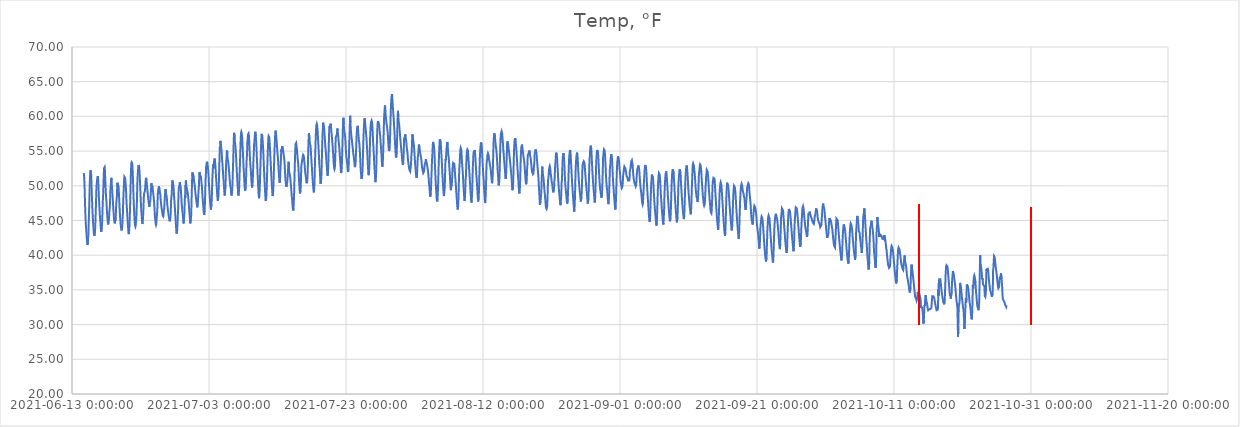
| Category | Temp, °F |
|---|---|
| 44361.716134259266 | 51.841 |
| 44361.75849537037 | 51.532 |
| 44361.80085648148 | 50.837 |
| 44361.8432175926 | 49.601 |
| 44361.8855787037 | 47.98 |
| 44361.927939814814 | 46.59 |
| 44361.97030092593 | 45.431 |
| 44362.012662037036 | 44.582 |
| 44362.05502314815 | 43.964 |
| 44362.097384259265 | 43.346 |
| 44362.13974537037 | 42.651 |
| 44362.18210648148 | 42.265 |
| 44362.2244675926 | 41.802 |
| 44362.26682870371 | 41.493 |
| 44362.30918981481 | 41.57 |
| 44362.35155092593 | 42.497 |
| 44362.39391203704 | 42.96 |
| 44362.436273148145 | 44.505 |
| 44362.47863425926 | 45.895 |
| 44362.520995370374 | 47.362 |
| 44362.56335648148 | 49.215 |
| 44362.605717592596 | 50.682 |
| 44362.64807870371 | 51.686 |
| 44362.69043981481 | 52.227 |
| 44362.73280092593 | 52.304 |
| 44362.77516203704 | 51.995 |
| 44362.817523148144 | 51.146 |
| 44362.85988425926 | 49.833 |
| 44362.90224537037 | 48.52 |
| 44362.944606481484 | 47.516 |
| 44362.986967592595 | 46.435 |
| 44363.029328703706 | 45.586 |
| 44363.07168981482 | 44.814 |
| 44363.11405092593 | 44.196 |
| 44363.15641203704 | 43.578 |
| 44363.19877314815 | 43.115 |
| 44363.24113425926 | 42.806 |
| 44363.28349537037 | 42.729 |
| 44363.32585648148 | 43.038 |
| 44363.36821759259 | 43.578 |
| 44363.410578703704 | 44.582 |
| 44363.452939814815 | 45.895 |
| 44363.49530092593 | 47.13 |
| 44363.53766203704 | 48.829 |
| 44363.58002314815 | 49.987 |
| 44363.622384259266 | 50.374 |
| 44363.66474537037 | 50.837 |
| 44363.70710648148 | 51.146 |
| 44363.7494675926 | 51.377 |
| 44363.7918287037 | 51.223 |
| 44363.83418981482 | 50.682 |
| 44363.876550925925 | 49.524 |
| 44363.918912037036 | 48.52 |
| 44363.961273148154 | 47.748 |
| 44364.00363425926 | 46.821 |
| 44364.04599537037 | 46.204 |
| 44364.08835648149 | 45.354 |
| 44364.1307175926 | 44.968 |
| 44364.1730787037 | 44.273 |
| 44364.21543981482 | 43.81 |
| 44364.25780092593 | 43.346 |
| 44364.300162037034 | 43.346 |
| 44364.34252314815 | 43.964 |
| 44364.38488425926 | 44.428 |
| 44364.42724537037 | 45.509 |
| 44364.469606481485 | 46.899 |
| 44364.511967592596 | 48.057 |
| 44364.5543287037 | 48.829 |
| 44364.59668981482 | 50.296 |
| 44364.63905092593 | 51.686 |
| 44364.68141203703 | 52.536 |
| 44364.72377314815 | 52.536 |
| 44364.76613425926 | 52.69 |
| 44364.80849537037 | 52.15 |
| 44364.850856481484 | 51.069 |
| 44364.893217592595 | 50.065 |
| 44364.935578703706 | 49.061 |
| 44364.97793981482 | 48.289 |
| 44365.02030092593 | 47.825 |
| 44365.06266203704 | 46.976 |
| 44365.10502314815 | 46.204 |
| 44365.14738425926 | 45.74 |
| 44365.18974537037 | 45.123 |
| 44365.23210648148 | 44.736 |
| 44365.27446759259 | 44.428 |
| 44365.316828703704 | 44.582 |
| 44365.359189814815 | 44.814 |
| 44365.401550925926 | 45.354 |
| 44365.44391203704 | 46.126 |
| 44365.486273148155 | 46.59 |
| 44365.52863425926 | 47.13 |
| 44365.57099537037 | 48.289 |
| 44365.61335648149 | 49.756 |
| 44365.65571759259 | 49.987 |
| 44365.6980787037 | 50.76 |
| 44365.74043981482 | 51.146 |
| 44365.782800925925 | 50.682 |
| 44365.825162037036 | 49.987 |
| 44365.867523148154 | 49.292 |
| 44365.90988425926 | 48.597 |
| 44365.95224537037 | 48.057 |
| 44365.99460648149 | 47.285 |
| 44366.0369675926 | 46.59 |
| 44366.0793287037 | 46.049 |
| 44366.12168981482 | 45.431 |
| 44366.16405092593 | 45.045 |
| 44366.206412037034 | 44.814 |
| 44366.24877314815 | 44.582 |
| 44366.29113425926 | 44.505 |
| 44366.333495370374 | 44.659 |
| 44366.375856481485 | 45.354 |
| 44366.41821759259 | 46.358 |
| 44366.46057870371 | 47.439 |
| 44366.50293981482 | 47.98 |
| 44366.54530092592 | 48.289 |
| 44366.58766203704 | 49.524 |
| 44366.63002314815 | 50.451 |
| 44366.67238425926 | 49.91 |
| 44366.71474537037 | 50.142 |
| 44366.757106481484 | 50.065 |
| 44366.799467592595 | 49.756 |
| 44366.841828703706 | 49.061 |
| 44366.88418981482 | 48.211 |
| 44366.92655092593 | 47.285 |
| 44366.96891203704 | 46.435 |
| 44367.01127314815 | 45.663 |
| 44367.05363425926 | 45.123 |
| 44367.09599537037 | 44.505 |
| 44367.13835648148 | 44.119 |
| 44367.18071759259 | 43.887 |
| 44367.223078703704 | 43.578 |
| 44367.265439814815 | 43.501 |
| 44367.307800925926 | 43.887 |
| 44367.350162037044 | 44.428 |
| 44367.39252314815 | 45.354 |
| 44367.43488425926 | 46.049 |
| 44367.47724537038 | 47.748 |
| 44367.51960648148 | 48.829 |
| 44367.56196759259 | 49.679 |
| 44367.60432870371 | 50.837 |
| 44367.646689814814 | 51.3 |
| 44367.689050925925 | 51.223 |
| 44367.73141203704 | 51.146 |
| 44367.77377314815 | 50.991 |
| 44367.81613425926 | 50.528 |
| 44367.858495370376 | 49.91 |
| 44367.90085648148 | 49.061 |
| 44367.94321759259 | 47.98 |
| 44367.98557870371 | 47.13 |
| 44368.02793981482 | 46.59 |
| 44368.07030092592 | 45.74 |
| 44368.11266203704 | 45.123 |
| 44368.15502314815 | 44.428 |
| 44368.197384259256 | 43.887 |
| 44368.239745370374 | 43.346 |
| 44368.282106481485 | 43.038 |
| 44368.32446759259 | 43.269 |
| 44368.36682870371 | 43.887 |
| 44368.40918981482 | 44.891 |
| 44368.45155092592 | 46.049 |
| 44368.49391203704 | 47.594 |
| 44368.53627314815 | 49.292 |
| 44368.57863425926 | 51.069 |
| 44368.62099537037 | 52.304 |
| 44368.663356481484 | 53.231 |
| 44368.705717592595 | 53.385 |
| 44368.748078703706 | 53.308 |
| 44368.79043981482 | 53.231 |
| 44368.83280092593 | 52.69 |
| 44368.87516203704 | 51.686 |
| 44368.91752314815 | 50.528 |
| 44368.95988425926 | 49.061 |
| 44369.00224537037 | 47.902 |
| 44369.04460648148 | 46.821 |
| 44369.08696759259 | 45.972 |
| 44369.129328703704 | 45.277 |
| 44369.171689814815 | 44.659 |
| 44369.21405092593 | 44.273 |
| 44369.25641203704 | 44.119 |
| 44369.29877314815 | 44.273 |
| 44369.341134259266 | 44.814 |
| 44369.38349537037 | 45.2 |
| 44369.42585648148 | 46.513 |
| 44369.4682175926 | 47.516 |
| 44369.5105787037 | 49.138 |
| 44369.552939814814 | 50.837 |
| 44369.59530092593 | 51.609 |
| 44369.637662037036 | 52.15 |
| 44369.68002314815 | 52.767 |
| 44369.722384259265 | 52.999 |
| 44369.76474537037 | 52.922 |
| 44369.80710648148 | 52.69 |
| 44369.8494675926 | 52.072 |
| 44369.89182870371 | 51.3 |
| 44369.93418981481 | 50.374 |
| 44369.97655092593 | 49.447 |
| 44370.01891203704 | 48.366 |
| 44370.061273148145 | 47.362 |
| 44370.10363425926 | 46.59 |
| 44370.145995370374 | 45.972 |
| 44370.18835648148 | 45.354 |
| 44370.230717592596 | 44.891 |
| 44370.27307870371 | 44.505 |
| 44370.31543981481 | 44.659 |
| 44370.35780092593 | 45.277 |
| 44370.40016203704 | 45.972 |
| 44370.442523148144 | 47.13 |
| 44370.48488425926 | 48.366 |
| 44370.52724537037 | 48.906 |
| 44370.569606481484 | 48.906 |
| 44370.611967592595 | 48.984 |
| 44370.654328703706 | 49.292 |
| 44370.69668981482 | 49.91 |
| 44370.73905092593 | 50.528 |
| 44370.78141203704 | 50.991 |
| 44370.82377314815 | 51.146 |
| 44370.86613425926 | 50.914 |
| 44370.90849537037 | 50.374 |
| 44370.95085648148 | 49.91 |
| 44370.99321759259 | 49.524 |
| 44371.035578703704 | 49.061 |
| 44371.077939814815 | 48.675 |
| 44371.12030092593 | 48.289 |
| 44371.16266203704 | 47.825 |
| 44371.20502314815 | 47.516 |
| 44371.247384259266 | 47.207 |
| 44371.28974537037 | 46.976 |
| 44371.33210648148 | 47.516 |
| 44371.3744675926 | 47.516 |
| 44371.4168287037 | 47.671 |
| 44371.45918981482 | 48.211 |
| 44371.501550925925 | 48.906 |
| 44371.543912037036 | 49.524 |
| 44371.586273148154 | 50.374 |
| 44371.62863425926 | 50.142 |
| 44371.67099537037 | 49.756 |
| 44371.71335648149 | 49.987 |
| 44371.7557175926 | 49.833 |
| 44371.7980787037 | 49.37 |
| 44371.84043981482 | 49.061 |
| 44371.88280092593 | 48.675 |
| 44371.925162037034 | 48.289 |
| 44371.96752314815 | 47.825 |
| 44372.00988425926 | 47.362 |
| 44372.05224537037 | 46.513 |
| 44372.094606481485 | 45.74 |
| 44372.136967592596 | 45.277 |
| 44372.1793287037 | 44.891 |
| 44372.22168981482 | 44.505 |
| 44372.26405092593 | 44.35 |
| 44372.30641203703 | 44.505 |
| 44372.34877314815 | 45.2 |
| 44372.39113425926 | 45.74 |
| 44372.43349537037 | 46.204 |
| 44372.475856481484 | 46.976 |
| 44372.518217592595 | 48.675 |
| 44372.560578703706 | 49.292 |
| 44372.60293981482 | 48.829 |
| 44372.64530092593 | 49.601 |
| 44372.68766203704 | 49.91 |
| 44372.73002314815 | 49.756 |
| 44372.77238425926 | 49.601 |
| 44372.81474537037 | 49.215 |
| 44372.85710648148 | 49.138 |
| 44372.89946759259 | 48.675 |
| 44372.941828703704 | 48.057 |
| 44372.984189814815 | 47.594 |
| 44373.026550925926 | 47.207 |
| 44373.06891203704 | 46.821 |
| 44373.111273148155 | 46.59 |
| 44373.15363425926 | 46.281 |
| 44373.19599537037 | 46.049 |
| 44373.23835648149 | 45.74 |
| 44373.28071759259 | 45.74 |
| 44373.3230787037 | 45.586 |
| 44373.36543981482 | 45.74 |
| 44373.407800925925 | 46.513 |
| 44373.450162037036 | 46.667 |
| 44373.492523148154 | 47.285 |
| 44373.53488425926 | 48.134 |
| 44373.57724537037 | 48.057 |
| 44373.61960648149 | 49.215 |
| 44373.6619675926 | 49.524 |
| 44373.7043287037 | 48.984 |
| 44373.74668981482 | 48.906 |
| 44373.78905092593 | 48.675 |
| 44373.831412037034 | 48.366 |
| 44373.87377314815 | 47.825 |
| 44373.91613425926 | 47.207 |
| 44373.958495370374 | 46.899 |
| 44374.000856481485 | 46.435 |
| 44374.04321759259 | 46.204 |
| 44374.08557870371 | 45.895 |
| 44374.12793981482 | 45.586 |
| 44374.17030092592 | 45.354 |
| 44374.21266203704 | 45.123 |
| 44374.25502314815 | 44.891 |
| 44374.29738425926 | 44.968 |
| 44374.33974537037 | 45.277 |
| 44374.382106481484 | 45.431 |
| 44374.424467592595 | 46.435 |
| 44374.466828703706 | 47.902 |
| 44374.50918981482 | 47.902 |
| 44374.55155092593 | 48.752 |
| 44374.59391203704 | 49.679 |
| 44374.63627314815 | 50.76 |
| 44374.67863425926 | 50.76 |
| 44374.72099537037 | 50.682 |
| 44374.76335648148 | 50.296 |
| 44374.80571759259 | 49.987 |
| 44374.848078703704 | 49.447 |
| 44374.890439814815 | 48.675 |
| 44374.932800925926 | 48.134 |
| 44374.975162037044 | 47.439 |
| 44375.01752314815 | 46.899 |
| 44375.05988425926 | 46.126 |
| 44375.10224537038 | 45.431 |
| 44375.14460648148 | 44.736 |
| 44375.18696759259 | 44.119 |
| 44375.22932870371 | 43.501 |
| 44375.271689814814 | 43.115 |
| 44375.314050925925 | 43.192 |
| 44375.35641203704 | 43.655 |
| 44375.39877314815 | 44.35 |
| 44375.44113425926 | 45.586 |
| 44375.483495370376 | 46.204 |
| 44375.52585648148 | 47.902 |
| 44375.56821759259 | 49.292 |
| 44375.61057870371 | 49.833 |
| 44375.65293981482 | 49.91 |
| 44375.69530092592 | 49.987 |
| 44375.73766203704 | 50.528 |
| 44375.78002314815 | 50.219 |
| 44375.822384259256 | 50.142 |
| 44375.864745370374 | 49.833 |
| 44375.907106481485 | 49.292 |
| 44375.94946759259 | 48.52 |
| 44375.99182870371 | 47.748 |
| 44376.03418981482 | 47.13 |
| 44376.07655092592 | 46.744 |
| 44376.11891203704 | 46.281 |
| 44376.16127314815 | 45.972 |
| 44376.20363425926 | 45.509 |
| 44376.24599537037 | 45.045 |
| 44376.288356481484 | 44.582 |
| 44376.330717592595 | 45.123 |
| 44376.373078703706 | 45.509 |
| 44376.41543981482 | 46.126 |
| 44376.45780092593 | 47.825 |
| 44376.50016203704 | 48.597 |
| 44376.54252314815 | 48.289 |
| 44376.58488425926 | 50.065 |
| 44376.62724537037 | 50.76 |
| 44376.66960648148 | 50.219 |
| 44376.71196759259 | 49.833 |
| 44376.754328703704 | 49.756 |
| 44376.796689814815 | 49.524 |
| 44376.83905092593 | 49.292 |
| 44376.88141203704 | 49.061 |
| 44376.92377314815 | 48.829 |
| 44376.966134259266 | 48.366 |
| 44377.00849537037 | 47.902 |
| 44377.05085648148 | 47.362 |
| 44377.0932175926 | 46.821 |
| 44377.1355787037 | 46.281 |
| 44377.177939814814 | 45.663 |
| 44377.22030092593 | 45.2 |
| 44377.262662037036 | 44.582 |
| 44377.30502314815 | 44.582 |
| 44377.347384259265 | 45.277 |
| 44377.38974537037 | 45.663 |
| 44377.43210648148 | 46.976 |
| 44377.4744675926 | 48.752 |
| 44377.51682870371 | 50.219 |
| 44377.55918981481 | 51.686 |
| 44377.60155092593 | 51.918 |
| 44377.64391203704 | 51.455 |
| 44377.686273148145 | 51.3 |
| 44377.72863425926 | 51.455 |
| 44377.770995370374 | 51.3 |
| 44377.81335648148 | 50.682 |
| 44377.855717592596 | 50.374 |
| 44377.89807870371 | 50.219 |
| 44377.94043981481 | 49.833 |
| 44377.98280092593 | 49.292 |
| 44378.02516203704 | 48.906 |
| 44378.067523148144 | 48.52 |
| 44378.10988425926 | 48.134 |
| 44378.15224537037 | 47.825 |
| 44378.194606481484 | 47.516 |
| 44378.236967592595 | 47.207 |
| 44378.279328703706 | 46.899 |
| 44378.32168981482 | 46.976 |
| 44378.36405092593 | 47.439 |
| 44378.40641203704 | 48.134 |
| 44378.44877314815 | 48.829 |
| 44378.49113425926 | 49.524 |
| 44378.53349537037 | 50.065 |
| 44378.57585648148 | 51.377 |
| 44378.61821759259 | 51.995 |
| 44378.660578703704 | 51.609 |
| 44378.702939814815 | 51.532 |
| 44378.74530092593 | 51.686 |
| 44378.78766203704 | 51.609 |
| 44378.83002314815 | 51.3 |
| 44378.872384259266 | 50.76 |
| 44378.91474537037 | 50.374 |
| 44378.95710648148 | 49.987 |
| 44378.9994675926 | 49.37 |
| 44379.0418287037 | 48.675 |
| 44379.08418981482 | 47.98 |
| 44379.126550925925 | 47.594 |
| 44379.168912037036 | 46.976 |
| 44379.211273148154 | 46.435 |
| 44379.25363425926 | 46.049 |
| 44379.29599537037 | 45.818 |
| 44379.33835648149 | 46.435 |
| 44379.3807175926 | 46.744 |
| 44379.4230787037 | 47.98 |
| 44379.46543981482 | 49.756 |
| 44379.50780092593 | 51.069 |
| 44379.550162037034 | 51.764 |
| 44379.59252314815 | 52.767 |
| 44379.63488425926 | 52.536 |
| 44379.67724537037 | 53.308 |
| 44379.719606481485 | 53.462 |
| 44379.761967592596 | 53.153 |
| 44379.8043287037 | 53.076 |
| 44379.84668981482 | 52.69 |
| 44379.88905092593 | 52.072 |
| 44379.93141203703 | 51.532 |
| 44379.97377314815 | 50.682 |
| 44380.01613425926 | 49.91 |
| 44380.05849537037 | 49.292 |
| 44380.100856481484 | 48.597 |
| 44380.143217592595 | 47.98 |
| 44380.185578703706 | 47.439 |
| 44380.22793981482 | 46.976 |
| 44380.27030092593 | 46.59 |
| 44380.31266203704 | 46.59 |
| 44380.35502314815 | 47.285 |
| 44380.39738425926 | 47.902 |
| 44380.43974537037 | 49.292 |
| 44380.48210648148 | 50.914 |
| 44380.52446759259 | 51.609 |
| 44380.566828703704 | 52.613 |
| 44380.609189814815 | 53.076 |
| 44380.651550925926 | 52.536 |
| 44380.69391203704 | 52.922 |
| 44380.736273148155 | 53.54 |
| 44380.77863425926 | 53.771 |
| 44380.82099537037 | 53.926 |
| 44380.86335648149 | 53.694 |
| 44380.90571759259 | 53.231 |
| 44380.9480787037 | 52.69 |
| 44380.99043981482 | 51.918 |
| 44381.032800925925 | 51.223 |
| 44381.075162037036 | 50.605 |
| 44381.117523148154 | 49.987 |
| 44381.15988425926 | 49.37 |
| 44381.20224537037 | 48.675 |
| 44381.24460648149 | 48.134 |
| 44381.2869675926 | 47.825 |
| 44381.3293287037 | 47.98 |
| 44381.37168981482 | 48.52 |
| 44381.41405092593 | 49.601 |
| 44381.456412037034 | 51.069 |
| 44381.49877314815 | 52.767 |
| 44381.54113425926 | 54.389 |
| 44381.583495370374 | 55.547 |
| 44381.625856481485 | 55.702 |
| 44381.66821759259 | 56.474 |
| 44381.71057870371 | 56.165 |
| 44381.75293981482 | 55.856 |
| 44381.79530092592 | 55.393 |
| 44381.83766203704 | 54.93 |
| 44381.88002314815 | 54.235 |
| 44381.92238425926 | 53.617 |
| 44381.96474537037 | 53.153 |
| 44382.007106481484 | 52.536 |
| 44382.049467592595 | 51.841 |
| 44382.091828703706 | 51.069 |
| 44382.13418981482 | 50.76 |
| 44382.17655092593 | 50.065 |
| 44382.21891203704 | 49.37 |
| 44382.26127314815 | 48.829 |
| 44382.30363425926 | 48.597 |
| 44382.34599537037 | 49.215 |
| 44382.38835648148 | 49.524 |
| 44382.43071759259 | 50.76 |
| 44382.473078703704 | 52.458 |
| 44382.515439814815 | 53.617 |
| 44382.557800925926 | 53.848 |
| 44382.600162037044 | 54.852 |
| 44382.64252314815 | 55.084 |
| 44382.68488425926 | 54.08 |
| 44382.72724537038 | 53.926 |
| 44382.76960648148 | 53.694 |
| 44382.81196759259 | 53.385 |
| 44382.85432870371 | 52.922 |
| 44382.896689814814 | 52.536 |
| 44382.939050925925 | 51.995 |
| 44382.98141203704 | 51.455 |
| 44383.02377314815 | 50.837 |
| 44383.06613425926 | 50.374 |
| 44383.108495370376 | 50.065 |
| 44383.15085648148 | 49.756 |
| 44383.19321759259 | 49.524 |
| 44383.23557870371 | 48.906 |
| 44383.27793981482 | 48.597 |
| 44383.32030092592 | 48.752 |
| 44383.36266203704 | 48.984 |
| 44383.40502314815 | 49.833 |
| 44383.447384259256 | 50.837 |
| 44383.489745370374 | 52.304 |
| 44383.532106481485 | 53.617 |
| 44383.57446759259 | 55.238 |
| 44383.61682870371 | 56.628 |
| 44383.65918981482 | 57.632 |
| 44383.70155092592 | 57.71 |
| 44383.74391203704 | 57.092 |
| 44383.78627314815 | 56.165 |
| 44383.82863425926 | 56.011 |
| 44383.87099537037 | 55.547 |
| 44383.913356481484 | 54.93 |
| 44383.955717592595 | 54.08 |
| 44383.998078703706 | 53.308 |
| 44384.04043981482 | 52.536 |
| 44384.08280092593 | 51.609 |
| 44384.12516203704 | 50.914 |
| 44384.16752314815 | 50.219 |
| 44384.20988425926 | 49.679 |
| 44384.25224537037 | 48.984 |
| 44384.29460648148 | 48.597 |
| 44384.33696759259 | 48.906 |
| 44384.379328703704 | 49.215 |
| 44384.421689814815 | 50.296 |
| 44384.46405092593 | 51.686 |
| 44384.50641203704 | 52.767 |
| 44384.54877314815 | 54.157 |
| 44384.591134259266 | 55.625 |
| 44384.63349537037 | 56.86 |
| 44384.67585648148 | 57.632 |
| 44384.7182175926 | 57.787 |
| 44384.7605787037 | 57.632 |
| 44384.802939814814 | 57.323 |
| 44384.84530092593 | 56.937 |
| 44384.887662037036 | 56.011 |
| 44384.93002314815 | 55.238 |
| 44384.972384259265 | 54.312 |
| 44385.01474537037 | 53.308 |
| 44385.05710648148 | 52.458 |
| 44385.0994675926 | 51.841 |
| 44385.14182870371 | 50.914 |
| 44385.18418981481 | 50.142 |
| 44385.22655092593 | 49.601 |
| 44385.26891203704 | 49.292 |
| 44385.311273148145 | 49.37 |
| 44385.35363425926 | 49.679 |
| 44385.395995370374 | 50.451 |
| 44385.43835648148 | 51.918 |
| 44385.480717592596 | 53.54 |
| 44385.52307870371 | 54.08 |
| 44385.56543981481 | 55.084 |
| 44385.60780092593 | 56.474 |
| 44385.65016203704 | 56.706 |
| 44385.692523148144 | 57.401 |
| 44385.73488425926 | 57.401 |
| 44385.77724537037 | 57.555 |
| 44385.819606481484 | 57.323 |
| 44385.861967592595 | 56.551 |
| 44385.904328703706 | 55.625 |
| 44385.94668981482 | 54.621 |
| 44385.98905092593 | 53.848 |
| 44386.03141203704 | 53.153 |
| 44386.07377314815 | 52.613 |
| 44386.11613425926 | 52.072 |
| 44386.15849537037 | 51.223 |
| 44386.20085648148 | 50.605 |
| 44386.24321759259 | 50.142 |
| 44386.285578703704 | 49.756 |
| 44386.327939814815 | 49.987 |
| 44386.37030092593 | 50.451 |
| 44386.41266203704 | 51.455 |
| 44386.45502314815 | 52.767 |
| 44386.497384259266 | 53.926 |
| 44386.53974537037 | 54.698 |
| 44386.58210648148 | 55.933 |
| 44386.6244675926 | 56.32 |
| 44386.6668287037 | 56.86 |
| 44386.70918981482 | 57.401 |
| 44386.751550925925 | 57.787 |
| 44386.793912037036 | 57.71 |
| 44386.836273148154 | 57.169 |
| 44386.87863425926 | 56.474 |
| 44386.92099537037 | 55.547 |
| 44386.96335648149 | 54.698 |
| 44387.0057175926 | 53.694 |
| 44387.0480787037 | 52.69 |
| 44387.09043981482 | 51.764 |
| 44387.13280092593 | 50.914 |
| 44387.175162037034 | 50.065 |
| 44387.21752314815 | 49.292 |
| 44387.25988425926 | 48.597 |
| 44387.30224537037 | 48.211 |
| 44387.344606481485 | 48.597 |
| 44387.386967592596 | 49.061 |
| 44387.4293287037 | 50.296 |
| 44387.47168981482 | 51.841 |
| 44387.51405092593 | 53.076 |
| 44387.55641203703 | 54.466 |
| 44387.59877314815 | 55.702 |
| 44387.64113425926 | 56.706 |
| 44387.68349537037 | 57.478 |
| 44387.725856481484 | 57.555 |
| 44387.768217592595 | 57.246 |
| 44387.810578703706 | 56.86 |
| 44387.85293981482 | 56.165 |
| 44387.89530092593 | 55.47 |
| 44387.93766203704 | 54.621 |
| 44387.98002314815 | 53.54 |
| 44388.02238425926 | 52.536 |
| 44388.06474537037 | 51.609 |
| 44388.10710648148 | 50.682 |
| 44388.14946759259 | 49.91 |
| 44388.191828703704 | 49.061 |
| 44388.234189814815 | 48.366 |
| 44388.276550925926 | 47.825 |
| 44388.31891203704 | 47.825 |
| 44388.361273148155 | 48.289 |
| 44388.40363425926 | 49.061 |
| 44388.44599537037 | 50.451 |
| 44388.48835648149 | 51.918 |
| 44388.53071759259 | 53.308 |
| 44388.5730787037 | 54.698 |
| 44388.61543981482 | 55.779 |
| 44388.657800925925 | 56.783 |
| 44388.700162037036 | 57.169 |
| 44388.742523148154 | 57.169 |
| 44388.78488425926 | 57.015 |
| 44388.82724537037 | 56.551 |
| 44388.86960648149 | 55.856 |
| 44388.9119675926 | 55.161 |
| 44388.9543287037 | 54.312 |
| 44388.99668981482 | 53.54 |
| 44389.03905092593 | 52.69 |
| 44389.081412037034 | 51.841 |
| 44389.12377314815 | 50.991 |
| 44389.16613425926 | 50.296 |
| 44389.208495370374 | 49.601 |
| 44389.250856481485 | 48.984 |
| 44389.29321759259 | 48.52 |
| 44389.33557870371 | 48.752 |
| 44389.37793981482 | 49.37 |
| 44389.42030092592 | 50.451 |
| 44389.46266203704 | 51.841 |
| 44389.50502314815 | 53.153 |
| 44389.54738425926 | 54.621 |
| 44389.58974537037 | 55.779 |
| 44389.632106481484 | 56.706 |
| 44389.674467592595 | 57.71 |
| 44389.716828703706 | 57.941 |
| 44389.75918981482 | 57.787 |
| 44389.80155092593 | 57.323 |
| 44389.84391203704 | 56.86 |
| 44389.88627314815 | 56.242 |
| 44389.92863425926 | 55.625 |
| 44389.97099537037 | 55.084 |
| 44390.01335648148 | 54.543 |
| 44390.05571759259 | 54.157 |
| 44390.098078703704 | 53.385 |
| 44390.140439814815 | 52.767 |
| 44390.182800925926 | 52.072 |
| 44390.225162037044 | 51.377 |
| 44390.26752314815 | 50.76 |
| 44390.30988425926 | 50.451 |
| 44390.35224537038 | 50.76 |
| 44390.39460648148 | 51.377 |
| 44390.43696759259 | 52.69 |
| 44390.47932870371 | 53.308 |
| 44390.521689814814 | 54.389 |
| 44390.564050925925 | 55.238 |
| 44390.60641203704 | 54.852 |
| 44390.64877314815 | 55.47 |
| 44390.69113425926 | 55.702 |
| 44390.733495370376 | 55.702 |
| 44390.77585648148 | 55.316 |
| 44390.81821759259 | 55.084 |
| 44390.86057870371 | 54.775 |
| 44390.90293981482 | 54.466 |
| 44390.94530092592 | 54.157 |
| 44390.98766203704 | 53.848 |
| 44391.03002314815 | 53.308 |
| 44391.072384259256 | 52.536 |
| 44391.114745370374 | 51.686 |
| 44391.157106481485 | 51.069 |
| 44391.19946759259 | 50.528 |
| 44391.24182870371 | 50.219 |
| 44391.28418981482 | 49.833 |
| 44391.32655092592 | 49.91 |
| 44391.36891203704 | 50.219 |
| 44391.41127314815 | 50.451 |
| 44391.45363425926 | 50.914 |
| 44391.49599537037 | 51.532 |
| 44391.538356481484 | 52.227 |
| 44391.580717592595 | 52.999 |
| 44391.623078703706 | 53.462 |
| 44391.66543981482 | 52.69 |
| 44391.70780092593 | 51.918 |
| 44391.75016203704 | 51.918 |
| 44391.79252314815 | 51.686 |
| 44391.83488425926 | 51.377 |
| 44391.87724537037 | 51.069 |
| 44391.91960648148 | 50.451 |
| 44391.96196759259 | 50.065 |
| 44392.004328703704 | 49.524 |
| 44392.046689814815 | 48.906 |
| 44392.08905092593 | 48.443 |
| 44392.13141203704 | 48.057 |
| 44392.17377314815 | 47.439 |
| 44392.216134259266 | 46.899 |
| 44392.25849537037 | 46.59 |
| 44392.30085648148 | 46.435 |
| 44392.3432175926 | 46.821 |
| 44392.3855787037 | 47.748 |
| 44392.427939814814 | 48.984 |
| 44392.47030092593 | 50.837 |
| 44392.512662037036 | 52.536 |
| 44392.55502314815 | 54.003 |
| 44392.597384259265 | 55.161 |
| 44392.63974537037 | 56.011 |
| 44392.68210648148 | 56.088 |
| 44392.7244675926 | 56.165 |
| 44392.76682870371 | 56.088 |
| 44392.80918981481 | 55.47 |
| 44392.85155092593 | 55.084 |
| 44392.89391203704 | 54.543 |
| 44392.936273148145 | 53.926 |
| 44392.97863425926 | 53.617 |
| 44393.020995370374 | 53.153 |
| 44393.06335648148 | 52.458 |
| 44393.105717592596 | 51.609 |
| 44393.14807870371 | 50.76 |
| 44393.19043981481 | 50.065 |
| 44393.23280092593 | 49.37 |
| 44393.27516203704 | 48.906 |
| 44393.317523148144 | 48.829 |
| 44393.35988425926 | 49.292 |
| 44393.40224537037 | 50.065 |
| 44393.444606481484 | 51.686 |
| 44393.486967592595 | 52.922 |
| 44393.529328703706 | 53.231 |
| 44393.57168981482 | 53.54 |
| 44393.61405092593 | 53.771 |
| 44393.65641203704 | 53.926 |
| 44393.69877314815 | 54.312 |
| 44393.74113425926 | 54.466 |
| 44393.78349537037 | 54.543 |
| 44393.82585648148 | 54.312 |
| 44393.86821759259 | 54.003 |
| 44393.910578703704 | 53.54 |
| 44393.952939814815 | 53.153 |
| 44393.99530092593 | 52.536 |
| 44394.03766203704 | 51.995 |
| 44394.08002314815 | 51.686 |
| 44394.122384259266 | 51.455 |
| 44394.16474537037 | 51.069 |
| 44394.20710648148 | 50.76 |
| 44394.2494675926 | 50.374 |
| 44394.2918287037 | 50.296 |
| 44394.33418981482 | 50.682 |
| 44394.376550925925 | 51.223 |
| 44394.418912037036 | 52.304 |
| 44394.461273148154 | 53.926 |
| 44394.50363425926 | 55.47 |
| 44394.54599537037 | 56.783 |
| 44394.58835648149 | 57.555 |
| 44394.6307175926 | 57.555 |
| 44394.6730787037 | 56.706 |
| 44394.71543981482 | 56.165 |
| 44394.75780092593 | 56.165 |
| 44394.800162037034 | 55.856 |
| 44394.84252314815 | 55.393 |
| 44394.88488425926 | 54.775 |
| 44394.92724537037 | 54.08 |
| 44394.969606481485 | 53.385 |
| 44395.011967592596 | 52.845 |
| 44395.0543287037 | 52.072 |
| 44395.09668981482 | 51.377 |
| 44395.13905092593 | 50.76 |
| 44395.18141203703 | 50.219 |
| 44395.22377314815 | 49.679 |
| 44395.26613425926 | 49.215 |
| 44395.30849537037 | 49.061 |
| 44395.350856481484 | 49.524 |
| 44395.393217592595 | 50.219 |
| 44395.435578703706 | 51.764 |
| 44395.47793981482 | 53.54 |
| 44395.52030092593 | 55.007 |
| 44395.56266203704 | 56.397 |
| 44395.60502314815 | 57.555 |
| 44395.64738425926 | 58.404 |
| 44395.68974537037 | 58.791 |
| 44395.73210648148 | 58.945 |
| 44395.77446759259 | 58.791 |
| 44395.816828703704 | 58.404 |
| 44395.859189814815 | 57.864 |
| 44395.901550925926 | 57.092 |
| 44395.94391203704 | 56.397 |
| 44395.986273148155 | 55.547 |
| 44396.02863425926 | 54.775 |
| 44396.07099537037 | 53.848 |
| 44396.11335648149 | 52.999 |
| 44396.15571759259 | 52.536 |
| 44396.1980787037 | 51.841 |
| 44396.24043981482 | 50.991 |
| 44396.282800925925 | 50.296 |
| 44396.325162037036 | 50.296 |
| 44396.367523148154 | 50.837 |
| 44396.40988425926 | 51.532 |
| 44396.45224537037 | 52.922 |
| 44396.49460648149 | 54.621 |
| 44396.5369675926 | 56.165 |
| 44396.5793287037 | 57.401 |
| 44396.62168981482 | 58.173 |
| 44396.66405092593 | 59.099 |
| 44396.706412037034 | 58.945 |
| 44396.74877314815 | 58.945 |
| 44396.79113425926 | 58.482 |
| 44396.833495370374 | 57.941 |
| 44396.875856481485 | 57.246 |
| 44396.91821759259 | 56.706 |
| 44396.96057870371 | 56.011 |
| 44397.00293981482 | 55.47 |
| 44397.04530092592 | 55.007 |
| 44397.08766203704 | 54.466 |
| 44397.13002314815 | 53.771 |
| 44397.17238425926 | 53.153 |
| 44397.21474537037 | 52.536 |
| 44397.257106481484 | 51.995 |
| 44397.299467592595 | 51.455 |
| 44397.341828703706 | 51.609 |
| 44397.38418981482 | 52.227 |
| 44397.42655092593 | 53.385 |
| 44397.46891203704 | 55.084 |
| 44397.51127314815 | 56.706 |
| 44397.55363425926 | 58.25 |
| 44397.59599537037 | 58.559 |
| 44397.63835648148 | 58.327 |
| 44397.68071759259 | 58.404 |
| 44397.723078703704 | 58.791 |
| 44397.765439814815 | 58.945 |
| 44397.807800925926 | 58.636 |
| 44397.850162037044 | 57.941 |
| 44397.89252314815 | 57.555 |
| 44397.93488425926 | 57.092 |
| 44397.97724537038 | 56.551 |
| 44398.01960648148 | 56.088 |
| 44398.06196759259 | 55.547 |
| 44398.10432870371 | 54.852 |
| 44398.146689814814 | 54.235 |
| 44398.189050925925 | 53.462 |
| 44398.23141203704 | 52.999 |
| 44398.27377314815 | 52.536 |
| 44398.31613425926 | 52.381 |
| 44398.358495370376 | 52.536 |
| 44398.40085648148 | 53.076 |
| 44398.44321759259 | 54.466 |
| 44398.48557870371 | 56.32 |
| 44398.52793981482 | 57.092 |
| 44398.57030092592 | 57.092 |
| 44398.61266203704 | 57.015 |
| 44398.65502314815 | 57.323 |
| 44398.697384259256 | 57.71 |
| 44398.739745370374 | 58.25 |
| 44398.782106481485 | 57.941 |
| 44398.82446759259 | 57.478 |
| 44398.86682870371 | 57.169 |
| 44398.90918981482 | 56.628 |
| 44398.95155092592 | 56.165 |
| 44398.99391203704 | 55.779 |
| 44399.03627314815 | 55.238 |
| 44399.07863425926 | 54.698 |
| 44399.12099537037 | 54.003 |
| 44399.163356481484 | 53.462 |
| 44399.205717592595 | 52.845 |
| 44399.248078703706 | 52.227 |
| 44399.29043981482 | 51.841 |
| 44399.33280092593 | 51.995 |
| 44399.37516203704 | 52.613 |
| 44399.41752314815 | 53.617 |
| 44399.45988425926 | 55.161 |
| 44399.50224537037 | 56.628 |
| 44399.54460648148 | 58.25 |
| 44399.58696759259 | 59.408 |
| 44399.629328703704 | 59.794 |
| 44399.671689814815 | 58.868 |
| 44399.71405092593 | 58.173 |
| 44399.75641203704 | 57.787 |
| 44399.79877314815 | 57.71 |
| 44399.841134259266 | 57.401 |
| 44399.88349537037 | 57.015 |
| 44399.92585648148 | 56.242 |
| 44399.9682175926 | 55.393 |
| 44400.0105787037 | 54.698 |
| 44400.052939814814 | 54.157 |
| 44400.09530092593 | 53.926 |
| 44400.137662037036 | 53.54 |
| 44400.18002314815 | 53.153 |
| 44400.222384259265 | 52.69 |
| 44400.26474537037 | 52.15 |
| 44400.30710648148 | 51.995 |
| 44400.3494675926 | 52.381 |
| 44400.39182870371 | 53.076 |
| 44400.43418981481 | 54.466 |
| 44400.47655092593 | 56.011 |
| 44400.51891203704 | 57.478 |
| 44400.561273148145 | 58.791 |
| 44400.60363425926 | 60.103 |
| 44400.645995370374 | 59.177 |
| 44400.68835648148 | 58.327 |
| 44400.730717592596 | 57.71 |
| 44400.77307870371 | 57.323 |
| 44400.81543981481 | 56.937 |
| 44400.85780092593 | 56.628 |
| 44400.90016203704 | 56.165 |
| 44400.942523148144 | 55.779 |
| 44400.98488425926 | 55.47 |
| 44401.02724537037 | 54.93 |
| 44401.069606481484 | 54.621 |
| 44401.111967592595 | 54.312 |
| 44401.154328703706 | 54.003 |
| 44401.19668981482 | 53.617 |
| 44401.23905092593 | 53.231 |
| 44401.28141203704 | 52.69 |
| 44401.32377314815 | 52.767 |
| 44401.36613425926 | 52.922 |
| 44401.40849537037 | 53.462 |
| 44401.45085648148 | 54.543 |
| 44401.49321759259 | 55.702 |
| 44401.535578703704 | 56.86 |
| 44401.577939814815 | 57.787 |
| 44401.62030092593 | 58.25 |
| 44401.66266203704 | 58.482 |
| 44401.70502314815 | 58.636 |
| 44401.747384259266 | 58.327 |
| 44401.78974537037 | 57.71 |
| 44401.83210648148 | 57.169 |
| 44401.8744675926 | 56.628 |
| 44401.9168287037 | 56.32 |
| 44401.95918981482 | 55.933 |
| 44402.001550925925 | 55.316 |
| 44402.043912037036 | 54.543 |
| 44402.086273148154 | 53.617 |
| 44402.12863425926 | 52.69 |
| 44402.17099537037 | 51.995 |
| 44402.21335648149 | 51.532 |
| 44402.2557175926 | 50.991 |
| 44402.2980787037 | 50.914 |
| 44402.34043981482 | 51.3 |
| 44402.38280092593 | 51.764 |
| 44402.425162037034 | 52.69 |
| 44402.46752314815 | 54.08 |
| 44402.50988425926 | 55.625 |
| 44402.55224537037 | 57.015 |
| 44402.594606481485 | 58.018 |
| 44402.636967592596 | 58.868 |
| 44402.6793287037 | 59.563 |
| 44402.72168981482 | 59.717 |
| 44402.76405092593 | 59.486 |
| 44402.80641203703 | 58.945 |
| 44402.84877314815 | 58.404 |
| 44402.89113425926 | 58.096 |
| 44402.93349537037 | 57.478 |
| 44402.975856481484 | 57.015 |
| 44403.018217592595 | 56.397 |
| 44403.060578703706 | 55.625 |
| 44403.10293981482 | 54.852 |
| 44403.14530092593 | 53.926 |
| 44403.18766203704 | 53.076 |
| 44403.23002314815 | 52.381 |
| 44403.27238425926 | 51.686 |
| 44403.31474537037 | 51.532 |
| 44403.35710648148 | 51.918 |
| 44403.39946759259 | 52.536 |
| 44403.441828703704 | 53.848 |
| 44403.484189814815 | 55.547 |
| 44403.526550925926 | 57.169 |
| 44403.56891203704 | 58.018 |
| 44403.611273148155 | 58.791 |
| 44403.65363425926 | 59.177 |
| 44403.69599537037 | 59.254 |
| 44403.73835648149 | 59.408 |
| 44403.78071759259 | 59.254 |
| 44403.8230787037 | 59.022 |
| 44403.86543981482 | 58.327 |
| 44403.907800925925 | 57.478 |
| 44403.950162037036 | 56.474 |
| 44403.992523148154 | 55.779 |
| 44404.03488425926 | 54.93 |
| 44404.07724537037 | 54.235 |
| 44404.11960648149 | 53.308 |
| 44404.1619675926 | 52.536 |
| 44404.2043287037 | 51.918 |
| 44404.24668981482 | 51.146 |
| 44404.28905092593 | 50.528 |
| 44404.331412037034 | 50.682 |
| 44404.37377314815 | 51.223 |
| 44404.41613425926 | 52.304 |
| 44404.458495370374 | 54.003 |
| 44404.500856481485 | 55.779 |
| 44404.54321759259 | 57.323 |
| 44404.58557870371 | 58.404 |
| 44404.62793981482 | 59.099 |
| 44404.67030092592 | 59.331 |
| 44404.71266203704 | 59.177 |
| 44404.75502314815 | 59.099 |
| 44404.79738425926 | 59.022 |
| 44404.83974537037 | 58.713 |
| 44404.882106481484 | 58.173 |
| 44404.924467592595 | 57.71 |
| 44404.966828703706 | 57.401 |
| 44405.00918981482 | 56.937 |
| 44405.05155092593 | 56.242 |
| 44405.09391203704 | 55.702 |
| 44405.13627314815 | 55.161 |
| 44405.17863425926 | 54.466 |
| 44405.22099537037 | 53.694 |
| 44405.26335648148 | 53.076 |
| 44405.30571759259 | 52.767 |
| 44405.348078703704 | 53.076 |
| 44405.390439814815 | 53.771 |
| 44405.432800925926 | 55.084 |
| 44405.475162037044 | 56.628 |
| 44405.51752314815 | 58.25 |
| 44405.55988425926 | 59.717 |
| 44405.60224537038 | 60.489 |
| 44405.64460648148 | 61.03 |
| 44405.68696759259 | 61.571 |
| 44405.72932870371 | 61.416 |
| 44405.771689814814 | 60.412 |
| 44405.814050925925 | 59.949 |
| 44405.85641203704 | 59.563 |
| 44405.89877314815 | 59.099 |
| 44405.94113425926 | 58.791 |
| 44405.983495370376 | 58.636 |
| 44406.02585648148 | 58.173 |
| 44406.06821759259 | 57.864 |
| 44406.11057870371 | 57.323 |
| 44406.15293981482 | 56.551 |
| 44406.19530092592 | 55.933 |
| 44406.23766203704 | 55.316 |
| 44406.28002314815 | 55.007 |
| 44406.322384259256 | 55.084 |
| 44406.364745370374 | 55.393 |
| 44406.407106481485 | 56.165 |
| 44406.44946759259 | 57.478 |
| 44406.49182870371 | 59.254 |
| 44406.53418981482 | 60.644 |
| 44406.57655092592 | 61.725 |
| 44406.61891203704 | 62.42 |
| 44406.66127314815 | 62.883 |
| 44406.70363425926 | 63.192 |
| 44406.74599537037 | 62.961 |
| 44406.788356481484 | 62.188 |
| 44406.830717592595 | 61.493 |
| 44406.873078703706 | 60.953 |
| 44406.91543981482 | 60.335 |
| 44406.95780092593 | 59.717 |
| 44407.00016203704 | 59.022 |
| 44407.04252314815 | 58.25 |
| 44407.08488425926 | 57.632 |
| 44407.12724537037 | 56.783 |
| 44407.16960648148 | 55.933 |
| 44407.21196759259 | 55.238 |
| 44407.254328703704 | 54.543 |
| 44407.296689814815 | 54.08 |
| 44407.33905092593 | 54.003 |
| 44407.38141203704 | 54.312 |
| 44407.42377314815 | 55.393 |
| 44407.466134259266 | 57.015 |
| 44407.50849537037 | 58.636 |
| 44407.55085648148 | 60.258 |
| 44407.5932175926 | 60.798 |
| 44407.6355787037 | 59.872 |
| 44407.677939814814 | 59.408 |
| 44407.72030092593 | 59.022 |
| 44407.762662037036 | 58.868 |
| 44407.80502314815 | 58.25 |
| 44407.847384259265 | 57.787 |
| 44407.88974537037 | 57.323 |
| 44407.93210648148 | 56.706 |
| 44407.9744675926 | 56.32 |
| 44408.01682870371 | 55.779 |
| 44408.05918981481 | 55.316 |
| 44408.10155092593 | 54.93 |
| 44408.14391203704 | 54.466 |
| 44408.186273148145 | 53.926 |
| 44408.22863425926 | 53.54 |
| 44408.270995370374 | 53.153 |
| 44408.31335648148 | 52.999 |
| 44408.355717592596 | 53.308 |
| 44408.39807870371 | 54.08 |
| 44408.44043981481 | 55.316 |
| 44408.48280092593 | 56.783 |
| 44408.52516203704 | 56.706 |
| 44408.567523148144 | 57.015 |
| 44408.60988425926 | 57.169 |
| 44408.65224537037 | 57.401 |
| 44408.694606481484 | 57.169 |
| 44408.736967592595 | 56.783 |
| 44408.779328703706 | 56.551 |
| 44408.82168981482 | 56.088 |
| 44408.86405092593 | 55.625 |
| 44408.90641203704 | 55.238 |
| 44408.94877314815 | 54.93 |
| 44408.99113425926 | 54.543 |
| 44409.03349537037 | 53.926 |
| 44409.07585648148 | 53.462 |
| 44409.11821759259 | 53.231 |
| 44409.160578703704 | 52.845 |
| 44409.202939814815 | 52.536 |
| 44409.24530092593 | 52.381 |
| 44409.28766203704 | 52.227 |
| 44409.33002314815 | 52.227 |
| 44409.372384259266 | 52.072 |
| 44409.41474537037 | 52.458 |
| 44409.45710648148 | 52.69 |
| 44409.4994675926 | 53.385 |
| 44409.5418287037 | 54.312 |
| 44409.58418981482 | 54.775 |
| 44409.626550925925 | 55.856 |
| 44409.668912037036 | 57.092 |
| 44409.711273148154 | 57.401 |
| 44409.75363425926 | 57.092 |
| 44409.79599537037 | 56.628 |
| 44409.83835648149 | 56.397 |
| 44409.8807175926 | 56.011 |
| 44409.9230787037 | 55.779 |
| 44409.96543981482 | 55.084 |
| 44410.00780092593 | 54.466 |
| 44410.050162037034 | 53.771 |
| 44410.09252314815 | 53.153 |
| 44410.13488425926 | 52.767 |
| 44410.17724537037 | 52.227 |
| 44410.219606481485 | 51.686 |
| 44410.261967592596 | 51.3 |
| 44410.3043287037 | 51.146 |
| 44410.34668981482 | 51.377 |
| 44410.38905092593 | 51.995 |
| 44410.43141203703 | 53.153 |
| 44410.47377314815 | 54.003 |
| 44410.51613425926 | 54.08 |
| 44410.55849537037 | 54.621 |
| 44410.600856481484 | 55.316 |
| 44410.643217592595 | 55.933 |
| 44410.685578703706 | 55.856 |
| 44410.72793981482 | 55.547 |
| 44410.77030092593 | 55.161 |
| 44410.81266203704 | 54.775 |
| 44410.85502314815 | 54.621 |
| 44410.89738425926 | 54.312 |
| 44410.93974537037 | 54.235 |
| 44410.98210648148 | 53.926 |
| 44411.02446759259 | 53.54 |
| 44411.066828703704 | 52.999 |
| 44411.109189814815 | 52.613 |
| 44411.151550925926 | 52.381 |
| 44411.19391203704 | 52.304 |
| 44411.236273148155 | 52.072 |
| 44411.27863425926 | 51.841 |
| 44411.32099537037 | 51.918 |
| 44411.36335648149 | 51.995 |
| 44411.40571759259 | 52.227 |
| 44411.4480787037 | 52.767 |
| 44411.49043981482 | 52.845 |
| 44411.532800925925 | 53.231 |
| 44411.575162037036 | 53.231 |
| 44411.617523148154 | 53.462 |
| 44411.65988425926 | 53.848 |
| 44411.70224537037 | 53.617 |
| 44411.74460648149 | 53.54 |
| 44411.7869675926 | 53.231 |
| 44411.8293287037 | 53.076 |
| 44411.87168981482 | 52.767 |
| 44411.91405092593 | 52.69 |
| 44411.956412037034 | 52.227 |
| 44411.99877314815 | 51.841 |
| 44412.04113425926 | 51.377 |
| 44412.083495370374 | 50.837 |
| 44412.125856481485 | 50.296 |
| 44412.16821759259 | 49.91 |
| 44412.21057870371 | 49.37 |
| 44412.25293981482 | 48.829 |
| 44412.29530092592 | 48.443 |
| 44412.33766203704 | 48.366 |
| 44412.38002314815 | 48.984 |
| 44412.42238425926 | 49.987 |
| 44412.46474537037 | 51.223 |
| 44412.507106481484 | 52.227 |
| 44412.549467592595 | 53.54 |
| 44412.591828703706 | 54.157 |
| 44412.63418981482 | 55.161 |
| 44412.67655092593 | 56.011 |
| 44412.71891203704 | 56.32 |
| 44412.76127314815 | 56.165 |
| 44412.80363425926 | 56.011 |
| 44412.84599537037 | 55.702 |
| 44412.88835648148 | 55.084 |
| 44412.93071759259 | 54.312 |
| 44412.973078703704 | 53.231 |
| 44413.015439814815 | 52.227 |
| 44413.057800925926 | 51.3 |
| 44413.100162037044 | 50.374 |
| 44413.14252314815 | 49.679 |
| 44413.18488425926 | 49.061 |
| 44413.22724537038 | 48.366 |
| 44413.26960648148 | 47.902 |
| 44413.31196759259 | 47.748 |
| 44413.35432870371 | 48.134 |
| 44413.396689814814 | 48.752 |
| 44413.439050925925 | 49.91 |
| 44413.48141203704 | 51.3 |
| 44413.52377314815 | 52.845 |
| 44413.56613425926 | 54.003 |
| 44413.608495370376 | 55.161 |
| 44413.65085648148 | 56.165 |
| 44413.69321759259 | 56.706 |
| 44413.73557870371 | 56.706 |
| 44413.77793981482 | 56.706 |
| 44413.82030092592 | 56.32 |
| 44413.86266203704 | 55.625 |
| 44413.90502314815 | 54.852 |
| 44413.947384259256 | 54.235 |
| 44413.989745370374 | 53.385 |
| 44414.032106481485 | 52.536 |
| 44414.07446759259 | 51.609 |
| 44414.11682870371 | 50.991 |
| 44414.15918981482 | 50.219 |
| 44414.20155092592 | 49.524 |
| 44414.24391203704 | 48.984 |
| 44414.28627314815 | 48.52 |
| 44414.32863425926 | 48.829 |
| 44414.37099537037 | 49.292 |
| 44414.413356481484 | 49.756 |
| 44414.455717592595 | 51.146 |
| 44414.498078703706 | 53.076 |
| 44414.54043981482 | 53.848 |
| 44414.58280092593 | 53.694 |
| 44414.62516203704 | 54.389 |
| 44414.66752314815 | 55.161 |
| 44414.70988425926 | 55.702 |
| 44414.75224537037 | 56.165 |
| 44414.79460648148 | 56.32 |
| 44414.83696759259 | 56.011 |
| 44414.879328703704 | 55.238 |
| 44414.921689814815 | 54.543 |
| 44414.96405092593 | 54.312 |
| 44415.00641203704 | 53.926 |
| 44415.04877314815 | 53.308 |
| 44415.091134259266 | 52.613 |
| 44415.13349537037 | 52.072 |
| 44415.17585648148 | 51.377 |
| 44415.2182175926 | 50.605 |
| 44415.2605787037 | 49.833 |
| 44415.302939814814 | 49.37 |
| 44415.34530092593 | 49.679 |
| 44415.387662037036 | 49.91 |
| 44415.43002314815 | 50.065 |
| 44415.472384259265 | 50.605 |
| 44415.51474537037 | 51.609 |
| 44415.55710648148 | 52.536 |
| 44415.5994675926 | 52.922 |
| 44415.64182870371 | 53.308 |
| 44415.68418981481 | 53.308 |
| 44415.72655092593 | 53.308 |
| 44415.76891203704 | 53.308 |
| 44415.811273148145 | 53.153 |
| 44415.85363425926 | 52.69 |
| 44415.895995370374 | 51.995 |
| 44415.93835648148 | 51.377 |
| 44415.980717592596 | 50.837 |
| 44416.02307870371 | 50.219 |
| 44416.06543981481 | 49.601 |
| 44416.10780092593 | 49.061 |
| 44416.15016203704 | 48.366 |
| 44416.192523148144 | 47.825 |
| 44416.23488425926 | 47.207 |
| 44416.27724537037 | 46.744 |
| 44416.319606481484 | 46.59 |
| 44416.361967592595 | 46.976 |
| 44416.404328703706 | 47.902 |
| 44416.44668981482 | 49.292 |
| 44416.48905092593 | 50.914 |
| 44416.53141203704 | 52.227 |
| 44416.57377314815 | 52.922 |
| 44416.61613425926 | 53.771 |
| 44416.65849537037 | 54.621 |
| 44416.70085648148 | 55.238 |
| 44416.74321759259 | 55.47 |
| 44416.785578703704 | 55.47 |
| 44416.827939814815 | 55.238 |
| 44416.87030092593 | 54.543 |
| 44416.91266203704 | 53.848 |
| 44416.95502314815 | 53.153 |
| 44416.997384259266 | 52.613 |
| 44417.03974537037 | 51.995 |
| 44417.08210648148 | 51.3 |
| 44417.1244675926 | 50.528 |
| 44417.1668287037 | 49.756 |
| 44417.20918981482 | 49.061 |
| 44417.251550925925 | 48.443 |
| 44417.293912037036 | 47.825 |
| 44417.336273148154 | 47.98 |
| 44417.37863425926 | 48.597 |
| 44417.42099537037 | 49.679 |
| 44417.46335648149 | 50.914 |
| 44417.5057175926 | 51.377 |
| 44417.5480787037 | 52.613 |
| 44417.59043981482 | 54.003 |
| 44417.63280092593 | 54.775 |
| 44417.675162037034 | 55.084 |
| 44417.71752314815 | 55.238 |
| 44417.75988425926 | 55.238 |
| 44417.80224537037 | 55.084 |
| 44417.844606481485 | 54.466 |
| 44417.886967592596 | 53.848 |
| 44417.9293287037 | 53.153 |
| 44417.97168981482 | 52.458 |
| 44418.01405092593 | 51.841 |
| 44418.05641203703 | 51.146 |
| 44418.09877314815 | 50.528 |
| 44418.14113425926 | 49.833 |
| 44418.18349537037 | 49.061 |
| 44418.225856481484 | 48.597 |
| 44418.268217592595 | 47.98 |
| 44418.310578703706 | 47.594 |
| 44418.35293981482 | 47.902 |
| 44418.39530092593 | 48.675 |
| 44418.43766203704 | 49.91 |
| 44418.48002314815 | 51.609 |
| 44418.52238425926 | 52.845 |
| 44418.56474537037 | 53.617 |
| 44418.60710648148 | 54.698 |
| 44418.64946759259 | 54.621 |
| 44418.691828703704 | 54.93 |
| 44418.734189814815 | 55.007 |
| 44418.776550925926 | 55.161 |
| 44418.81891203704 | 55.161 |
| 44418.861273148155 | 54.466 |
| 44418.90363425926 | 53.771 |
| 44418.94599537037 | 52.999 |
| 44418.98835648149 | 52.304 |
| 44419.03071759259 | 51.609 |
| 44419.0730787037 | 51.069 |
| 44419.11543981482 | 50.374 |
| 44419.157800925925 | 49.679 |
| 44419.200162037036 | 49.061 |
| 44419.242523148154 | 48.366 |
| 44419.28488425926 | 47.748 |
| 44419.32724537037 | 47.748 |
| 44419.36960648149 | 48.289 |
| 44419.4119675926 | 49.215 |
| 44419.4543287037 | 50.837 |
| 44419.49668981482 | 52.458 |
| 44419.53905092593 | 54.003 |
| 44419.581412037034 | 54.852 |
| 44419.62377314815 | 55.47 |
| 44419.66613425926 | 55.933 |
| 44419.708495370374 | 56.242 |
| 44419.750856481485 | 56.32 |
| 44419.79321759259 | 56.011 |
| 44419.83557870371 | 55.393 |
| 44419.87793981482 | 54.621 |
| 44419.92030092592 | 53.694 |
| 44419.96266203704 | 52.999 |
| 44420.00502314815 | 52.15 |
| 44420.04738425926 | 51.455 |
| 44420.08974537037 | 50.914 |
| 44420.132106481484 | 49.987 |
| 44420.174467592595 | 49.37 |
| 44420.216828703706 | 48.752 |
| 44420.25918981482 | 48.134 |
| 44420.30155092593 | 47.516 |
| 44420.34391203704 | 47.748 |
| 44420.38627314815 | 48.443 |
| 44420.42863425926 | 49.601 |
| 44420.47099537037 | 51.377 |
| 44420.51335648148 | 53.076 |
| 44420.55571759259 | 53.617 |
| 44420.598078703704 | 53.771 |
| 44420.640439814815 | 54.389 |
| 44420.682800925926 | 54.543 |
| 44420.725162037044 | 54.698 |
| 44420.76752314815 | 54.698 |
| 44420.80988425926 | 54.466 |
| 44420.85224537038 | 54.157 |
| 44420.89460648148 | 53.694 |
| 44420.93696759259 | 53.54 |
| 44420.97932870371 | 53.231 |
| 44421.021689814814 | 52.922 |
| 44421.064050925925 | 52.767 |
| 44421.10641203704 | 52.458 |
| 44421.14877314815 | 52.15 |
| 44421.19113425926 | 51.686 |
| 44421.233495370376 | 51.223 |
| 44421.27585648148 | 50.682 |
| 44421.31821759259 | 50.374 |
| 44421.36057870371 | 50.528 |
| 44421.40293981482 | 51.223 |
| 44421.44530092592 | 52.536 |
| 44421.48766203704 | 54.235 |
| 44421.53002314815 | 55.779 |
| 44421.572384259256 | 56.783 |
| 44421.614745370374 | 57.401 |
| 44421.657106481485 | 57.555 |
| 44421.69946759259 | 57.478 |
| 44421.74182870371 | 57.092 |
| 44421.78418981482 | 56.551 |
| 44421.82655092592 | 56.088 |
| 44421.86891203704 | 55.702 |
| 44421.91127314815 | 55.47 |
| 44421.95363425926 | 55.084 |
| 44421.99599537037 | 54.621 |
| 44422.038356481484 | 53.926 |
| 44422.080717592595 | 53.153 |
| 44422.123078703706 | 52.536 |
| 44422.16543981482 | 51.841 |
| 44422.20780092593 | 51.3 |
| 44422.25016203704 | 50.682 |
| 44422.29252314815 | 50.065 |
| 44422.33488425926 | 50.142 |
| 44422.37724537037 | 50.682 |
| 44422.41960648148 | 51.686 |
| 44422.46196759259 | 53.231 |
| 44422.504328703704 | 54.852 |
| 44422.546689814815 | 56.474 |
| 44422.58905092593 | 57.246 |
| 44422.63141203704 | 57.555 |
| 44422.67377314815 | 57.71 |
| 44422.716134259266 | 57.864 |
| 44422.75849537037 | 57.864 |
| 44422.80085648148 | 57.555 |
| 44422.8432175926 | 56.937 |
| 44422.8855787037 | 56.397 |
| 44422.927939814814 | 55.856 |
| 44422.97030092593 | 55.161 |
| 44423.012662037036 | 54.698 |
| 44423.05502314815 | 54.08 |
| 44423.097384259265 | 53.54 |
| 44423.13974537037 | 52.999 |
| 44423.18210648148 | 52.536 |
| 44423.2244675926 | 51.995 |
| 44423.26682870371 | 51.3 |
| 44423.30918981481 | 50.991 |
| 44423.35155092593 | 51.3 |
| 44423.39391203704 | 52.072 |
| 44423.436273148145 | 53.231 |
| 44423.47863425926 | 54.543 |
| 44423.520995370374 | 55.933 |
| 44423.56335648148 | 56.397 |
| 44423.605717592596 | 56.32 |
| 44423.64807870371 | 56.32 |
| 44423.69043981481 | 55.856 |
| 44423.73280092593 | 55.393 |
| 44423.77516203704 | 55.084 |
| 44423.817523148144 | 54.775 |
| 44423.85988425926 | 54.312 |
| 44423.90224537037 | 54.003 |
| 44423.944606481484 | 53.617 |
| 44423.986967592595 | 53.153 |
| 44424.029328703706 | 52.69 |
| 44424.07168981482 | 52.227 |
| 44424.11405092593 | 51.918 |
| 44424.15641203704 | 51.3 |
| 44424.19877314815 | 50.76 |
| 44424.24113425926 | 50.065 |
| 44424.28349537037 | 49.37 |
| 44424.32585648148 | 49.292 |
| 44424.36821759259 | 49.756 |
| 44424.410578703704 | 50.682 |
| 44424.452939814815 | 52.15 |
| 44424.49530092593 | 53.771 |
| 44424.53766203704 | 55.238 |
| 44424.58002314815 | 56.011 |
| 44424.622384259266 | 56.628 |
| 44424.66474537037 | 56.706 |
| 44424.70710648148 | 56.86 |
| 44424.7494675926 | 56.551 |
| 44424.7918287037 | 56.165 |
| 44424.83418981482 | 55.625 |
| 44424.876550925925 | 55.084 |
| 44424.918912037036 | 54.389 |
| 44424.961273148154 | 53.771 |
| 44425.00363425926 | 52.999 |
| 44425.04599537037 | 52.381 |
| 44425.08835648149 | 51.686 |
| 44425.1307175926 | 51.146 |
| 44425.1730787037 | 50.605 |
| 44425.21543981482 | 49.91 |
| 44425.25780092593 | 49.37 |
| 44425.300162037034 | 48.906 |
| 44425.34252314815 | 49.138 |
| 44425.38488425926 | 49.679 |
| 44425.42724537037 | 50.837 |
| 44425.469606481485 | 52.536 |
| 44425.511967592596 | 54.08 |
| 44425.5543287037 | 55.007 |
| 44425.59668981482 | 55.547 |
| 44425.63905092593 | 55.702 |
| 44425.68141203703 | 55.933 |
| 44425.72377314815 | 55.702 |
| 44425.76613425926 | 55.393 |
| 44425.80849537037 | 55.084 |
| 44425.850856481484 | 54.775 |
| 44425.893217592595 | 54.312 |
| 44425.935578703706 | 54.003 |
| 44425.97793981482 | 53.848 |
| 44426.02030092593 | 53.462 |
| 44426.06266203704 | 53.076 |
| 44426.10502314815 | 52.381 |
| 44426.14738425926 | 51.686 |
| 44426.18974537037 | 51.146 |
| 44426.23210648148 | 50.682 |
| 44426.27446759259 | 50.219 |
| 44426.316828703704 | 50.142 |
| 44426.359189814815 | 50.451 |
| 44426.401550925926 | 51.3 |
| 44426.44391203704 | 52.536 |
| 44426.486273148155 | 52.999 |
| 44426.52863425926 | 54.389 |
| 44426.57099537037 | 54.389 |
| 44426.61335648149 | 54.312 |
| 44426.65571759259 | 54.698 |
| 44426.6980787037 | 54.775 |
| 44426.74043981482 | 54.93 |
| 44426.782800925925 | 55.084 |
| 44426.825162037036 | 54.621 |
| 44426.867523148154 | 54.389 |
| 44426.90988425926 | 54.235 |
| 44426.95224537037 | 54.08 |
| 44426.99460648149 | 53.617 |
| 44427.0369675926 | 53.231 |
| 44427.0793287037 | 52.767 |
| 44427.12168981482 | 52.304 |
| 44427.16405092593 | 52.072 |
| 44427.206412037034 | 51.918 |
| 44427.24877314815 | 51.841 |
| 44427.29113425926 | 51.686 |
| 44427.333495370374 | 51.764 |
| 44427.375856481485 | 51.841 |
| 44427.41821759259 | 52.536 |
| 44427.46057870371 | 52.999 |
| 44427.50293981482 | 53.54 |
| 44427.54530092592 | 54.698 |
| 44427.58766203704 | 54.775 |
| 44427.63002314815 | 55.007 |
| 44427.67238425926 | 55.238 |
| 44427.71474537037 | 55.084 |
| 44427.757106481484 | 55.161 |
| 44427.799467592595 | 54.775 |
| 44427.841828703706 | 54.235 |
| 44427.88418981482 | 53.694 |
| 44427.92655092593 | 53.231 |
| 44427.96891203704 | 52.69 |
| 44428.01127314815 | 52.227 |
| 44428.05363425926 | 51.609 |
| 44428.09599537037 | 51.069 |
| 44428.13835648148 | 50.296 |
| 44428.18071759259 | 49.524 |
| 44428.223078703704 | 48.829 |
| 44428.265439814815 | 48.057 |
| 44428.307800925926 | 47.285 |
| 44428.350162037044 | 47.362 |
| 44428.39252314815 | 47.748 |
| 44428.43488425926 | 48.211 |
| 44428.47724537038 | 48.675 |
| 44428.51960648148 | 49.447 |
| 44428.56196759259 | 50.76 |
| 44428.60432870371 | 51.841 |
| 44428.646689814814 | 52.767 |
| 44428.689050925925 | 52.458 |
| 44428.73141203704 | 51.841 |
| 44428.77377314815 | 51.455 |
| 44428.81613425926 | 51.223 |
| 44428.858495370376 | 50.837 |
| 44428.90085648148 | 50.219 |
| 44428.94321759259 | 49.679 |
| 44428.98557870371 | 49.138 |
| 44429.02793981482 | 48.752 |
| 44429.07030092592 | 48.289 |
| 44429.11266203704 | 47.825 |
| 44429.15502314815 | 47.285 |
| 44429.197384259256 | 46.821 |
| 44429.239745370374 | 46.744 |
| 44429.282106481485 | 46.667 |
| 44429.32446759259 | 46.667 |
| 44429.36682870371 | 47.053 |
| 44429.40918981482 | 47.98 |
| 44429.45155092592 | 49.292 |
| 44429.49391203704 | 50.837 |
| 44429.53627314815 | 50.991 |
| 44429.57863425926 | 51.455 |
| 44429.62099537037 | 52.072 |
| 44429.663356481484 | 52.536 |
| 44429.705717592595 | 52.69 |
| 44429.748078703706 | 52.845 |
| 44429.79043981482 | 52.69 |
| 44429.83280092593 | 52.304 |
| 44429.87516203704 | 51.764 |
| 44429.91752314815 | 51.532 |
| 44429.95988425926 | 51.223 |
| 44430.00224537037 | 50.837 |
| 44430.04460648148 | 50.451 |
| 44430.08696759259 | 50.296 |
| 44430.129328703704 | 49.987 |
| 44430.171689814815 | 49.524 |
| 44430.21405092593 | 49.292 |
| 44430.25641203704 | 49.061 |
| 44430.29877314815 | 49.061 |
| 44430.341134259266 | 49.447 |
| 44430.38349537037 | 49.91 |
| 44430.42585648148 | 50.76 |
| 44430.4682175926 | 51.223 |
| 44430.5105787037 | 52.458 |
| 44430.552939814814 | 53.076 |
| 44430.59530092593 | 53.617 |
| 44430.637662037036 | 54.389 |
| 44430.68002314815 | 54.775 |
| 44430.722384259265 | 54.775 |
| 44430.76474537037 | 54.543 |
| 44430.80710648148 | 54.157 |
| 44430.8494675926 | 53.385 |
| 44430.89182870371 | 52.613 |
| 44430.93418981481 | 51.841 |
| 44430.97655092593 | 50.991 |
| 44431.01891203704 | 50.374 |
| 44431.061273148145 | 49.756 |
| 44431.10363425926 | 49.215 |
| 44431.145995370374 | 48.752 |
| 44431.18835648148 | 48.289 |
| 44431.230717592596 | 47.825 |
| 44431.27307870371 | 47.439 |
| 44431.31543981481 | 47.207 |
| 44431.35780092593 | 47.671 |
| 44431.40016203704 | 48.289 |
| 44431.442523148144 | 49.37 |
| 44431.48488425926 | 50.605 |
| 44431.52724537037 | 50.837 |
| 44431.569606481484 | 52.15 |
| 44431.611967592595 | 53.385 |
| 44431.654328703706 | 54.157 |
| 44431.69668981482 | 54.389 |
| 44431.73905092593 | 54.698 |
| 44431.78141203704 | 54.466 |
| 44431.82377314815 | 53.926 |
| 44431.86613425926 | 53.231 |
| 44431.90849537037 | 52.304 |
| 44431.95085648148 | 51.377 |
| 44431.99321759259 | 50.605 |
| 44432.035578703704 | 49.987 |
| 44432.077939814815 | 49.447 |
| 44432.12030092593 | 49.061 |
| 44432.16266203704 | 48.597 |
| 44432.20502314815 | 48.134 |
| 44432.247384259266 | 47.748 |
| 44432.28974537037 | 47.439 |
| 44432.33210648148 | 47.362 |
| 44432.3744675926 | 48.057 |
| 44432.4168287037 | 49.138 |
| 44432.45918981482 | 50.451 |
| 44432.501550925925 | 51.918 |
| 44432.543912037036 | 53.231 |
| 44432.586273148154 | 54.157 |
| 44432.62863425926 | 54.621 |
| 44432.67099537037 | 54.93 |
| 44432.71335648149 | 55.161 |
| 44432.7557175926 | 54.93 |
| 44432.7980787037 | 54.466 |
| 44432.84043981482 | 53.694 |
| 44432.88280092593 | 52.845 |
| 44432.925162037034 | 51.918 |
| 44432.96752314815 | 51.223 |
| 44433.00988425926 | 50.374 |
| 44433.05224537037 | 49.756 |
| 44433.094606481485 | 49.138 |
| 44433.136967592596 | 48.52 |
| 44433.1793287037 | 47.98 |
| 44433.22168981482 | 47.362 |
| 44433.26405092593 | 46.899 |
| 44433.30641203703 | 46.281 |
| 44433.34877314815 | 46.513 |
| 44433.39113425926 | 47.285 |
| 44433.43349537037 | 48.597 |
| 44433.475856481484 | 50.528 |
| 44433.518217592595 | 52.15 |
| 44433.560578703706 | 53.076 |
| 44433.60293981482 | 53.848 |
| 44433.64530092593 | 54.312 |
| 44433.68766203704 | 54.621 |
| 44433.73002314815 | 54.775 |
| 44433.77238425926 | 54.466 |
| 44433.81474537037 | 54.08 |
| 44433.85710648148 | 53.308 |
| 44433.89946759259 | 52.381 |
| 44433.941828703704 | 51.609 |
| 44433.984189814815 | 50.837 |
| 44434.026550925926 | 50.296 |
| 44434.06891203704 | 49.756 |
| 44434.111273148155 | 49.292 |
| 44434.15363425926 | 48.906 |
| 44434.19599537037 | 48.52 |
| 44434.23835648149 | 48.134 |
| 44434.28071759259 | 47.748 |
| 44434.3230787037 | 47.671 |
| 44434.36543981482 | 48.289 |
| 44434.407800925925 | 48.984 |
| 44434.450162037036 | 50.142 |
| 44434.492523148154 | 51.841 |
| 44434.53488425926 | 52.999 |
| 44434.57724537037 | 53.153 |
| 44434.61960648149 | 53.308 |
| 44434.6619675926 | 53.385 |
| 44434.7043287037 | 53.54 |
| 44434.74668981482 | 53.617 |
| 44434.78905092593 | 53.385 |
| 44434.831412037034 | 53.076 |
| 44434.87377314815 | 52.536 |
| 44434.91613425926 | 51.918 |
| 44434.958495370374 | 51.377 |
| 44435.000856481485 | 50.837 |
| 44435.04321759259 | 50.219 |
| 44435.08557870371 | 49.833 |
| 44435.12793981482 | 49.292 |
| 44435.17030092592 | 48.906 |
| 44435.21266203704 | 48.443 |
| 44435.25502314815 | 47.825 |
| 44435.29738425926 | 47.439 |
| 44435.33974537037 | 47.439 |
| 44435.382106481484 | 48.134 |
| 44435.424467592595 | 49.215 |
| 44435.466828703706 | 50.837 |
| 44435.50918981482 | 52.381 |
| 44435.55155092593 | 53.926 |
| 44435.59391203704 | 54.157 |
| 44435.63627314815 | 55.084 |
| 44435.67863425926 | 55.547 |
| 44435.72099537037 | 55.779 |
| 44435.76335648148 | 55.702 |
| 44435.80571759259 | 55.316 |
| 44435.848078703704 | 54.621 |
| 44435.890439814815 | 53.694 |
| 44435.932800925926 | 52.845 |
| 44435.975162037044 | 51.995 |
| 44436.01752314815 | 51.3 |
| 44436.05988425926 | 50.605 |
| 44436.10224537038 | 50.065 |
| 44436.14460648148 | 49.524 |
| 44436.18696759259 | 48.984 |
| 44436.22932870371 | 48.443 |
| 44436.271689814814 | 47.902 |
| 44436.314050925925 | 47.594 |
| 44436.35641203704 | 47.902 |
| 44436.39877314815 | 48.829 |
| 44436.44113425926 | 50.142 |
| 44436.483495370376 | 51.686 |
| 44436.52585648148 | 53.231 |
| 44436.56821759259 | 54.08 |
| 44436.61057870371 | 54.775 |
| 44436.65293981482 | 55.161 |
| 44436.69530092592 | 55.238 |
| 44436.73766203704 | 55.161 |
| 44436.78002314815 | 54.852 |
| 44436.822384259256 | 54.235 |
| 44436.864745370374 | 53.54 |
| 44436.907106481485 | 52.613 |
| 44436.94946759259 | 51.764 |
| 44436.99182870371 | 50.991 |
| 44437.03418981482 | 50.296 |
| 44437.07655092592 | 49.756 |
| 44437.11891203704 | 49.447 |
| 44437.16127314815 | 49.138 |
| 44437.20363425926 | 48.829 |
| 44437.24599537037 | 48.597 |
| 44437.288356481484 | 48.289 |
| 44437.330717592595 | 48.211 |
| 44437.373078703706 | 48.829 |
| 44437.41543981482 | 49.833 |
| 44437.45780092593 | 51.3 |
| 44437.50016203704 | 52.767 |
| 44437.54252314815 | 54.312 |
| 44437.58488425926 | 54.466 |
| 44437.62724537037 | 55.007 |
| 44437.66960648148 | 55.238 |
| 44437.71196759259 | 55.161 |
| 44437.754328703704 | 55.084 |
| 44437.796689814815 | 54.698 |
| 44437.83905092593 | 54.003 |
| 44437.88141203704 | 53.153 |
| 44437.92377314815 | 52.072 |
| 44437.966134259266 | 51.223 |
| 44438.00849537037 | 50.528 |
| 44438.05085648148 | 50.065 |
| 44438.0932175926 | 49.601 |
| 44438.1355787037 | 49.215 |
| 44438.177939814814 | 48.675 |
| 44438.22030092593 | 48.134 |
| 44438.262662037036 | 47.748 |
| 44438.30502314815 | 47.362 |
| 44438.347384259265 | 47.516 |
| 44438.38974537037 | 48.289 |
| 44438.43210648148 | 49.37 |
| 44438.4744675926 | 50.914 |
| 44438.51682870371 | 52.304 |
| 44438.55918981481 | 52.845 |
| 44438.60155092593 | 53.231 |
| 44438.64391203704 | 53.926 |
| 44438.686273148145 | 54.312 |
| 44438.72863425926 | 54.543 |
| 44438.770995370374 | 54.312 |
| 44438.81335648148 | 54.08 |
| 44438.855717592596 | 53.385 |
| 44438.89807870371 | 52.536 |
| 44438.94043981481 | 51.609 |
| 44438.98280092593 | 50.76 |
| 44439.02516203704 | 50.142 |
| 44439.067523148144 | 49.524 |
| 44439.10988425926 | 48.906 |
| 44439.15224537037 | 48.366 |
| 44439.194606481484 | 47.825 |
| 44439.236967592595 | 47.207 |
| 44439.279328703706 | 46.821 |
| 44439.32168981482 | 46.59 |
| 44439.36405092593 | 47.053 |
| 44439.40641203704 | 47.825 |
| 44439.44877314815 | 49.215 |
| 44439.49113425926 | 50.528 |
| 44439.53349537037 | 51.995 |
| 44439.57585648148 | 52.922 |
| 44439.61821759259 | 53.54 |
| 44439.660578703704 | 53.848 |
| 44439.702939814815 | 54.235 |
| 44439.74530092593 | 54.157 |
| 44439.78766203704 | 54.003 |
| 44439.83002314815 | 53.694 |
| 44439.872384259266 | 53.308 |
| 44439.91474537037 | 52.69 |
| 44439.95710648148 | 52.227 |
| 44439.9994675926 | 51.841 |
| 44440.0418287037 | 51.223 |
| 44440.08418981482 | 50.605 |
| 44440.126550925925 | 50.374 |
| 44440.168912037036 | 50.142 |
| 44440.211273148154 | 49.91 |
| 44440.25363425926 | 49.679 |
| 44440.29599537037 | 49.679 |
| 44440.33835648149 | 49.833 |
| 44440.3807175926 | 50.219 |
| 44440.4230787037 | 50.76 |
| 44440.46543981482 | 51.609 |
| 44440.50780092593 | 51.841 |
| 44440.550162037034 | 52.227 |
| 44440.59252314815 | 52.536 |
| 44440.63488425926 | 52.767 |
| 44440.67724537037 | 52.767 |
| 44440.719606481485 | 52.69 |
| 44440.761967592596 | 52.69 |
| 44440.8043287037 | 52.458 |
| 44440.84668981482 | 52.15 |
| 44440.88905092593 | 51.995 |
| 44440.93141203703 | 51.609 |
| 44440.97377314815 | 51.377 |
| 44441.01613425926 | 51.3 |
| 44441.05849537037 | 51.223 |
| 44441.100856481484 | 51.069 |
| 44441.143217592595 | 51.069 |
| 44441.185578703706 | 50.76 |
| 44441.22793981482 | 50.837 |
| 44441.27030092593 | 50.682 |
| 44441.31266203704 | 50.682 |
| 44441.35502314815 | 50.76 |
| 44441.39738425926 | 51.069 |
| 44441.43974537037 | 52.072 |
| 44441.48210648148 | 52.15 |
| 44441.52446759259 | 52.536 |
| 44441.566828703704 | 52.767 |
| 44441.609189814815 | 53.231 |
| 44441.651550925926 | 53.54 |
| 44441.69391203704 | 53.54 |
| 44441.736273148155 | 53.694 |
| 44441.77863425926 | 53.385 |
| 44441.82099537037 | 53.231 |
| 44441.86335648149 | 52.69 |
| 44441.90571759259 | 51.995 |
| 44441.9480787037 | 51.455 |
| 44441.99043981482 | 51.069 |
| 44442.032800925925 | 50.837 |
| 44442.075162037036 | 50.605 |
| 44442.117523148154 | 50.374 |
| 44442.15988425926 | 50.374 |
| 44442.20224537037 | 50.219 |
| 44442.24460648149 | 50.142 |
| 44442.2869675926 | 49.91 |
| 44442.3293287037 | 49.987 |
| 44442.37168981482 | 50.142 |
| 44442.41405092593 | 50.991 |
| 44442.456412037034 | 51.609 |
| 44442.49877314815 | 51.609 |
| 44442.54113425926 | 52.458 |
| 44442.583495370374 | 52.381 |
| 44442.625856481485 | 52.613 |
| 44442.66821759259 | 52.922 |
| 44442.71057870371 | 52.922 |
| 44442.75293981482 | 52.845 |
| 44442.79530092592 | 52.381 |
| 44442.83766203704 | 51.918 |
| 44442.88002314815 | 51.223 |
| 44442.92238425926 | 50.605 |
| 44442.96474537037 | 50.142 |
| 44443.007106481484 | 49.679 |
| 44443.049467592595 | 49.37 |
| 44443.091828703706 | 49.061 |
| 44443.13418981482 | 48.675 |
| 44443.17655092593 | 48.211 |
| 44443.21891203704 | 47.748 |
| 44443.26127314815 | 47.439 |
| 44443.30363425926 | 47.285 |
| 44443.34599537037 | 47.439 |
| 44443.38835648148 | 48.211 |
| 44443.43071759259 | 48.984 |
| 44443.473078703704 | 50.142 |
| 44443.515439814815 | 50.914 |
| 44443.557800925926 | 51.609 |
| 44443.600162037044 | 52.304 |
| 44443.64252314815 | 52.69 |
| 44443.68488425926 | 52.999 |
| 44443.72724537038 | 52.999 |
| 44443.76960648148 | 52.922 |
| 44443.81196759259 | 52.458 |
| 44443.85432870371 | 51.918 |
| 44443.896689814814 | 51.069 |
| 44443.939050925925 | 50.219 |
| 44443.98141203704 | 49.524 |
| 44444.02377314815 | 48.675 |
| 44444.06613425926 | 48.134 |
| 44444.108495370376 | 47.439 |
| 44444.15085648148 | 46.821 |
| 44444.19321759259 | 46.204 |
| 44444.23557870371 | 45.586 |
| 44444.27793981482 | 45.123 |
| 44444.32030092592 | 44.814 |
| 44444.36266203704 | 45.045 |
| 44444.40502314815 | 45.663 |
| 44444.447384259256 | 47.13 |
| 44444.489745370374 | 48.366 |
| 44444.532106481485 | 49.679 |
| 44444.57446759259 | 50.528 |
| 44444.61682870371 | 51.069 |
| 44444.65918981482 | 51.609 |
| 44444.70155092592 | 51.686 |
| 44444.74391203704 | 51.686 |
| 44444.78627314815 | 51.532 |
| 44444.82863425926 | 51.069 |
| 44444.87099537037 | 50.219 |
| 44444.913356481484 | 49.524 |
| 44444.955717592595 | 48.752 |
| 44444.998078703706 | 47.98 |
| 44445.04043981482 | 47.362 |
| 44445.08280092593 | 46.744 |
| 44445.12516203704 | 46.281 |
| 44445.16752314815 | 45.818 |
| 44445.20988425926 | 45.354 |
| 44445.25224537037 | 44.891 |
| 44445.29460648148 | 44.428 |
| 44445.33696759259 | 44.273 |
| 44445.379328703704 | 44.968 |
| 44445.421689814815 | 46.049 |
| 44445.46405092593 | 47.439 |
| 44445.50641203704 | 48.906 |
| 44445.54877314815 | 50.142 |
| 44445.591134259266 | 50.76 |
| 44445.63349537037 | 51.455 |
| 44445.67585648148 | 51.841 |
| 44445.7182175926 | 51.918 |
| 44445.7605787037 | 51.918 |
| 44445.802939814814 | 51.609 |
| 44445.84530092593 | 50.991 |
| 44445.887662037036 | 50.219 |
| 44445.93002314815 | 49.447 |
| 44445.972384259265 | 48.597 |
| 44446.01474537037 | 47.98 |
| 44446.05710648148 | 47.439 |
| 44446.0994675926 | 46.744 |
| 44446.14182870371 | 46.204 |
| 44446.18418981481 | 45.74 |
| 44446.22655092593 | 45.123 |
| 44446.26891203704 | 44.814 |
| 44446.311273148145 | 44.428 |
| 44446.35363425926 | 44.659 |
| 44446.395995370374 | 45.509 |
| 44446.43835648148 | 46.513 |
| 44446.480717592596 | 48.366 |
| 44446.52307870371 | 49.524 |
| 44446.56543981481 | 50.451 |
| 44446.60780092593 | 51.069 |
| 44446.65016203704 | 51.686 |
| 44446.692523148144 | 51.841 |
| 44446.73488425926 | 52.072 |
| 44446.77724537037 | 51.918 |
| 44446.819606481484 | 51.455 |
| 44446.861967592595 | 50.837 |
| 44446.904328703706 | 50.142 |
| 44446.94668981482 | 49.37 |
| 44446.98905092593 | 48.52 |
| 44447.03141203704 | 47.98 |
| 44447.07377314815 | 47.362 |
| 44447.11613425926 | 46.821 |
| 44447.15849537037 | 46.281 |
| 44447.20085648148 | 45.663 |
| 44447.24321759259 | 45.354 |
| 44447.285578703704 | 44.891 |
| 44447.327939814815 | 44.814 |
| 44447.37030092593 | 45.277 |
| 44447.41266203704 | 46.204 |
| 44447.45502314815 | 47.516 |
| 44447.497384259266 | 48.984 |
| 44447.53974537037 | 50.374 |
| 44447.58210648148 | 51.146 |
| 44447.6244675926 | 51.918 |
| 44447.6668287037 | 52.227 |
| 44447.70918981482 | 52.381 |
| 44447.751550925925 | 52.458 |
| 44447.793912037036 | 52.304 |
| 44447.836273148154 | 51.841 |
| 44447.87863425926 | 50.914 |
| 44447.92099537037 | 50.296 |
| 44447.96335648149 | 49.37 |
| 44448.0057175926 | 48.675 |
| 44448.0480787037 | 47.902 |
| 44448.09043981482 | 47.285 |
| 44448.13280092593 | 46.59 |
| 44448.175162037034 | 46.126 |
| 44448.21752314815 | 45.586 |
| 44448.25988425926 | 45.045 |
| 44448.30224537037 | 44.736 |
| 44448.344606481485 | 44.736 |
| 44448.386967592596 | 45.431 |
| 44448.4293287037 | 46.435 |
| 44448.47168981482 | 47.98 |
| 44448.51405092593 | 49.679 |
| 44448.55641203703 | 50.605 |
| 44448.59877314815 | 51.3 |
| 44448.64113425926 | 51.841 |
| 44448.68349537037 | 52.227 |
| 44448.725856481484 | 52.381 |
| 44448.768217592595 | 52.304 |
| 44448.810578703706 | 51.995 |
| 44448.85293981482 | 51.532 |
| 44448.89530092593 | 50.605 |
| 44448.93766203704 | 49.833 |
| 44448.98002314815 | 49.215 |
| 44449.02238425926 | 48.443 |
| 44449.06474537037 | 47.902 |
| 44449.10710648148 | 47.285 |
| 44449.14946759259 | 46.744 |
| 44449.191828703704 | 46.281 |
| 44449.234189814815 | 45.895 |
| 44449.276550925926 | 45.431 |
| 44449.31891203704 | 45.2 |
| 44449.361273148155 | 45.431 |
| 44449.40363425926 | 46.281 |
| 44449.44599537037 | 47.516 |
| 44449.48835648149 | 48.906 |
| 44449.53071759259 | 50.451 |
| 44449.5730787037 | 51.3 |
| 44449.61543981482 | 51.995 |
| 44449.657800925925 | 52.536 |
| 44449.700162037036 | 52.69 |
| 44449.742523148154 | 52.922 |
| 44449.78488425926 | 52.536 |
| 44449.82724537037 | 52.15 |
| 44449.86960648149 | 51.455 |
| 44449.9119675926 | 50.76 |
| 44449.9543287037 | 49.91 |
| 44449.99668981482 | 49.215 |
| 44450.03905092593 | 48.675 |
| 44450.081412037034 | 48.134 |
| 44450.12377314815 | 47.671 |
| 44450.16613425926 | 47.13 |
| 44450.208495370374 | 46.744 |
| 44450.250856481485 | 46.435 |
| 44450.29321759259 | 46.049 |
| 44450.33557870371 | 45.895 |
| 44450.37793981482 | 46.513 |
| 44450.42030092592 | 47.439 |
| 44450.46266203704 | 48.829 |
| 44450.50502314815 | 50.142 |
| 44450.54738425926 | 51.3 |
| 44450.58974537037 | 52.458 |
| 44450.632106481484 | 53.076 |
| 44450.674467592595 | 53.231 |
| 44450.716828703706 | 53.231 |
| 44450.75918981482 | 53.153 |
| 44450.80155092593 | 52.845 |
| 44450.84391203704 | 52.227 |
| 44450.88627314815 | 51.995 |
| 44450.92863425926 | 51.455 |
| 44450.97099537037 | 50.837 |
| 44451.01335648148 | 50.142 |
| 44451.05571759259 | 49.524 |
| 44451.098078703704 | 49.061 |
| 44451.140439814815 | 48.752 |
| 44451.182800925926 | 48.366 |
| 44451.225162037044 | 48.289 |
| 44451.26752314815 | 48.134 |
| 44451.30988425926 | 47.671 |
| 44451.35224537038 | 47.825 |
| 44451.39460648148 | 48.289 |
| 44451.43696759259 | 49.215 |
| 44451.47932870371 | 50.451 |
| 44451.521689814814 | 51.686 |
| 44451.564050925925 | 52.072 |
| 44451.60641203704 | 52.381 |
| 44451.64877314815 | 52.845 |
| 44451.69113425926 | 53.076 |
| 44451.733495370376 | 52.999 |
| 44451.77585648148 | 52.922 |
| 44451.81821759259 | 52.536 |
| 44451.86057870371 | 52.072 |
| 44451.90293981482 | 51.377 |
| 44451.94530092592 | 50.682 |
| 44451.98766203704 | 50.065 |
| 44452.03002314815 | 49.447 |
| 44452.072384259256 | 48.906 |
| 44452.114745370374 | 48.366 |
| 44452.157106481485 | 48.057 |
| 44452.19946759259 | 47.594 |
| 44452.24182870371 | 47.285 |
| 44452.28418981482 | 47.13 |
| 44452.32655092592 | 47.13 |
| 44452.36891203704 | 47.362 |
| 44452.41127314815 | 47.98 |
| 44452.45363425926 | 48.906 |
| 44452.49599537037 | 49.91 |
| 44452.538356481484 | 50.528 |
| 44452.580717592595 | 51.532 |
| 44452.623078703706 | 51.764 |
| 44452.66543981482 | 52.304 |
| 44452.70780092593 | 52.381 |
| 44452.75016203704 | 52.227 |
| 44452.79252314815 | 52.072 |
| 44452.83488425926 | 51.686 |
| 44452.87724537037 | 51.146 |
| 44452.91960648148 | 50.528 |
| 44452.96196759259 | 49.756 |
| 44453.004328703704 | 49.138 |
| 44453.046689814815 | 48.597 |
| 44453.08905092593 | 47.98 |
| 44453.13141203704 | 47.516 |
| 44453.17377314815 | 46.899 |
| 44453.216134259266 | 46.513 |
| 44453.25849537037 | 46.204 |
| 44453.30085648148 | 46.126 |
| 44453.3432175926 | 46.049 |
| 44453.3855787037 | 46.435 |
| 44453.427939814814 | 47.362 |
| 44453.47030092593 | 48.597 |
| 44453.512662037036 | 50.065 |
| 44453.55502314815 | 50.605 |
| 44453.597384259265 | 50.528 |
| 44453.63974537037 | 51.146 |
| 44453.68210648148 | 51.069 |
| 44453.7244675926 | 51.146 |
| 44453.76682870371 | 51.223 |
| 44453.80918981481 | 50.991 |
| 44453.85155092593 | 50.296 |
| 44453.89391203704 | 49.524 |
| 44453.936273148145 | 48.829 |
| 44453.97863425926 | 48.057 |
| 44454.020995370374 | 47.362 |
| 44454.06335648148 | 46.744 |
| 44454.105717592596 | 46.126 |
| 44454.14807870371 | 45.509 |
| 44454.19043981481 | 44.968 |
| 44454.23280092593 | 44.582 |
| 44454.27516203704 | 44.041 |
| 44454.317523148144 | 43.655 |
| 44454.35988425926 | 43.887 |
| 44454.40224537037 | 44.736 |
| 44454.444606481484 | 46.049 |
| 44454.486967592595 | 47.362 |
| 44454.529328703706 | 48.752 |
| 44454.57168981482 | 49.447 |
| 44454.61405092593 | 49.987 |
| 44454.65641203704 | 50.374 |
| 44454.69877314815 | 50.528 |
| 44454.74113425926 | 50.528 |
| 44454.78349537037 | 50.219 |
| 44454.82585648148 | 49.833 |
| 44454.86821759259 | 49.138 |
| 44454.910578703704 | 48.52 |
| 44454.952939814815 | 47.825 |
| 44454.99530092593 | 47.13 |
| 44455.03766203704 | 46.358 |
| 44455.08002314815 | 45.74 |
| 44455.122384259266 | 44.968 |
| 44455.16474537037 | 44.505 |
| 44455.20710648148 | 43.887 |
| 44455.2494675926 | 43.346 |
| 44455.2918287037 | 43.038 |
| 44455.33418981482 | 42.806 |
| 44455.376550925925 | 43.424 |
| 44455.418912037036 | 44.428 |
| 44455.461273148154 | 45.818 |
| 44455.50363425926 | 47.516 |
| 44455.54599537037 | 48.906 |
| 44455.58835648149 | 49.679 |
| 44455.6307175926 | 50.451 |
| 44455.6730787037 | 50.451 |
| 44455.71543981482 | 50.451 |
| 44455.75780092593 | 50.374 |
| 44455.800162037034 | 49.91 |
| 44455.84252314815 | 49.524 |
| 44455.88488425926 | 48.984 |
| 44455.92724537037 | 48.366 |
| 44455.969606481485 | 47.671 |
| 44456.011967592596 | 47.053 |
| 44456.0543287037 | 46.358 |
| 44456.09668981482 | 45.972 |
| 44456.13905092593 | 45.431 |
| 44456.18141203703 | 44.891 |
| 44456.22377314815 | 44.428 |
| 44456.26613425926 | 43.964 |
| 44456.30849537037 | 43.578 |
| 44456.350856481484 | 43.655 |
| 44456.393217592595 | 44.35 |
| 44456.435578703706 | 45.663 |
| 44456.47793981482 | 46.821 |
| 44456.52030092593 | 48.134 |
| 44456.56266203704 | 49.138 |
| 44456.60502314815 | 49.601 |
| 44456.64738425926 | 49.987 |
| 44456.68974537037 | 50.065 |
| 44456.73210648148 | 49.91 |
| 44456.77446759259 | 49.756 |
| 44456.816828703704 | 49.292 |
| 44456.859189814815 | 48.906 |
| 44456.901550925926 | 48.211 |
| 44456.94391203704 | 47.439 |
| 44456.986273148155 | 46.667 |
| 44457.02863425926 | 46.049 |
| 44457.07099537037 | 45.354 |
| 44457.11335648149 | 44.736 |
| 44457.15571759259 | 44.196 |
| 44457.1980787037 | 43.655 |
| 44457.24043981482 | 43.192 |
| 44457.282800925925 | 42.729 |
| 44457.325162037036 | 42.343 |
| 44457.367523148154 | 42.806 |
| 44457.40988425926 | 43.578 |
| 44457.45224537037 | 45.354 |
| 44457.49460648149 | 46.59 |
| 44457.5369675926 | 47.902 |
| 44457.5793287037 | 48.597 |
| 44457.62168981482 | 49.447 |
| 44457.66405092593 | 49.91 |
| 44457.706412037034 | 50.142 |
| 44457.74877314815 | 50.296 |
| 44457.79113425926 | 50.296 |
| 44457.833495370374 | 50.065 |
| 44457.875856481485 | 49.679 |
| 44457.91821759259 | 49.292 |
| 44457.96057870371 | 49.138 |
| 44458.00293981482 | 48.984 |
| 44458.04530092592 | 48.829 |
| 44458.08766203704 | 48.52 |
| 44458.13002314815 | 48.366 |
| 44458.17238425926 | 48.211 |
| 44458.21474537037 | 47.671 |
| 44458.257106481484 | 47.13 |
| 44458.299467592595 | 46.744 |
| 44458.341828703706 | 46.513 |
| 44458.38418981482 | 47.13 |
| 44458.42655092593 | 47.671 |
| 44458.46891203704 | 48.211 |
| 44458.51127314815 | 48.829 |
| 44458.55363425926 | 49.601 |
| 44458.59599537037 | 49.91 |
| 44458.63835648148 | 50.065 |
| 44458.68071759259 | 50.142 |
| 44458.723078703704 | 50.374 |
| 44458.765439814815 | 50.451 |
| 44458.807800925926 | 50.219 |
| 44458.850162037044 | 49.833 |
| 44458.89252314815 | 49.215 |
| 44458.93488425926 | 48.752 |
| 44458.97724537038 | 48.289 |
| 44459.01960648148 | 47.902 |
| 44459.06196759259 | 47.439 |
| 44459.10432870371 | 46.667 |
| 44459.146689814814 | 45.895 |
| 44459.189050925925 | 45.354 |
| 44459.23141203704 | 45.045 |
| 44459.27377314815 | 44.814 |
| 44459.31613425926 | 44.659 |
| 44459.358495370376 | 44.428 |
| 44459.40085648148 | 44.582 |
| 44459.44321759259 | 45.431 |
| 44459.48557870371 | 45.895 |
| 44459.52793981482 | 46.513 |
| 44459.57030092592 | 46.899 |
| 44459.61266203704 | 47.13 |
| 44459.65502314815 | 47.207 |
| 44459.697384259256 | 46.976 |
| 44459.739745370374 | 46.899 |
| 44459.782106481485 | 46.667 |
| 44459.82446759259 | 46.358 |
| 44459.86682870371 | 46.126 |
| 44459.90918981482 | 45.586 |
| 44459.95155092592 | 44.891 |
| 44459.99391203704 | 44.428 |
| 44460.03627314815 | 44.041 |
| 44460.07863425926 | 43.655 |
| 44460.12099537037 | 43.346 |
| 44460.163356481484 | 43.038 |
| 44460.205717592595 | 42.497 |
| 44460.248078703706 | 42.111 |
| 44460.29043981482 | 41.493 |
| 44460.33280092593 | 40.953 |
| 44460.37516203704 | 41.184 |
| 44460.41752314815 | 41.802 |
| 44460.45988425926 | 42.883 |
| 44460.50224537037 | 44.196 |
| 44460.54460648148 | 44.505 |
| 44460.58696759259 | 44.891 |
| 44460.629328703704 | 45.354 |
| 44460.671689814815 | 45.586 |
| 44460.71405092593 | 45.509 |
| 44460.75641203704 | 45.431 |
| 44460.79877314815 | 45.123 |
| 44460.841134259266 | 44.736 |
| 44460.88349537037 | 44.273 |
| 44460.92585648148 | 43.655 |
| 44460.9682175926 | 43.038 |
| 44461.0105787037 | 42.343 |
| 44461.052939814814 | 41.725 |
| 44461.09530092593 | 41.184 |
| 44461.137662037036 | 40.644 |
| 44461.18002314815 | 40.18 |
| 44461.222384259265 | 39.794 |
| 44461.26474537037 | 39.408 |
| 44461.30710648148 | 39.099 |
| 44461.3494675926 | 39.099 |
| 44461.39182870371 | 39.64 |
| 44461.43418981481 | 41.107 |
| 44461.47655092593 | 42.265 |
| 44461.51891203704 | 43.655 |
| 44461.561273148145 | 44.428 |
| 44461.60363425926 | 45.123 |
| 44461.645995370374 | 45.586 |
| 44461.68835648148 | 45.74 |
| 44461.730717592596 | 45.818 |
| 44461.77307870371 | 45.74 |
| 44461.81543981481 | 45.354 |
| 44461.85780092593 | 44.736 |
| 44461.90016203704 | 44.196 |
| 44461.942523148144 | 43.578 |
| 44461.98488425926 | 42.883 |
| 44462.02724537037 | 42.343 |
| 44462.069606481484 | 41.648 |
| 44462.111967592595 | 41.107 |
| 44462.154328703706 | 40.567 |
| 44462.19668981482 | 40.18 |
| 44462.23905092593 | 39.717 |
| 44462.28141203704 | 39.331 |
| 44462.32377314815 | 38.945 |
| 44462.36613425926 | 39.177 |
| 44462.40849537037 | 39.949 |
| 44462.45085648148 | 41.493 |
| 44462.49321759259 | 42.651 |
| 44462.535578703704 | 43.887 |
| 44462.577939814815 | 44.659 |
| 44462.62030092593 | 45.2 |
| 44462.66266203704 | 45.509 |
| 44462.70502314815 | 45.74 |
| 44462.747384259266 | 45.972 |
| 44462.78974537037 | 45.895 |
| 44462.83210648148 | 45.586 |
| 44462.8744675926 | 45.509 |
| 44462.9168287037 | 45.354 |
| 44462.95918981482 | 45.045 |
| 44463.001550925925 | 44.659 |
| 44463.043912037036 | 44.119 |
| 44463.086273148154 | 43.655 |
| 44463.12863425926 | 43.192 |
| 44463.17099537037 | 42.651 |
| 44463.21335648149 | 42.034 |
| 44463.2557175926 | 41.493 |
| 44463.2980787037 | 41.03 |
| 44463.34043981482 | 40.875 |
| 44463.38280092593 | 41.416 |
| 44463.425162037034 | 42.497 |
| 44463.46752314815 | 43.578 |
| 44463.50988425926 | 45.431 |
| 44463.55224537037 | 45.74 |
| 44463.594606481485 | 46.126 |
| 44463.636967592596 | 46.744 |
| 44463.6793287037 | 46.821 |
| 44463.72168981482 | 46.744 |
| 44463.76405092593 | 46.667 |
| 44463.80641203703 | 46.435 |
| 44463.84877314815 | 45.818 |
| 44463.89113425926 | 45.277 |
| 44463.93349537037 | 44.736 |
| 44463.975856481484 | 44.119 |
| 44464.018217592595 | 43.578 |
| 44464.060578703706 | 43.038 |
| 44464.10293981482 | 42.343 |
| 44464.14530092593 | 41.879 |
| 44464.18766203704 | 41.493 |
| 44464.23002314815 | 41.03 |
| 44464.27238425926 | 40.644 |
| 44464.31474537037 | 40.335 |
| 44464.35710648148 | 40.489 |
| 44464.39946759259 | 41.107 |
| 44464.441828703704 | 42.651 |
| 44464.484189814815 | 43.578 |
| 44464.526550925926 | 44.736 |
| 44464.56891203704 | 45.74 |
| 44464.611273148155 | 46.204 |
| 44464.65363425926 | 46.667 |
| 44464.69599537037 | 46.744 |
| 44464.73835648149 | 46.744 |
| 44464.78071759259 | 46.59 |
| 44464.8230787037 | 46.204 |
| 44464.86543981482 | 45.74 |
| 44464.907800925925 | 45.354 |
| 44464.950162037036 | 44.814 |
| 44464.992523148154 | 44.273 |
| 44465.03488425926 | 43.733 |
| 44465.07724537037 | 43.115 |
| 44465.11960648149 | 42.651 |
| 44465.1619675926 | 42.188 |
| 44465.2043287037 | 41.725 |
| 44465.24668981482 | 41.261 |
| 44465.28905092593 | 40.875 |
| 44465.331412037034 | 40.567 |
| 44465.37377314815 | 41.03 |
| 44465.41613425926 | 41.879 |
| 44465.458495370374 | 43.578 |
| 44465.500856481485 | 44.736 |
| 44465.54321759259 | 45.354 |
| 44465.58557870371 | 45.972 |
| 44465.62793981482 | 46.667 |
| 44465.67030092592 | 46.899 |
| 44465.71266203704 | 46.976 |
| 44465.75502314815 | 46.899 |
| 44465.79738425926 | 46.744 |
| 44465.83974537037 | 46.513 |
| 44465.882106481484 | 46.126 |
| 44465.924467592595 | 45.586 |
| 44465.966828703706 | 45.123 |
| 44466.00918981482 | 44.582 |
| 44466.05155092593 | 44.041 |
| 44466.09391203704 | 43.501 |
| 44466.13627314815 | 42.883 |
| 44466.17863425926 | 42.42 |
| 44466.22099537037 | 41.956 |
| 44466.26335648148 | 41.493 |
| 44466.30571759259 | 41.184 |
| 44466.348078703704 | 41.184 |
| 44466.390439814815 | 41.725 |
| 44466.432800925926 | 42.96 |
| 44466.475162037044 | 43.964 |
| 44466.51752314815 | 44.814 |
| 44466.55988425926 | 45.509 |
| 44466.60224537038 | 46.281 |
| 44466.64460648148 | 46.821 |
| 44466.68696759259 | 46.899 |
| 44466.72932870371 | 47.053 |
| 44466.771689814814 | 46.976 |
| 44466.814050925925 | 46.59 |
| 44466.85641203704 | 46.126 |
| 44466.89877314815 | 45.586 |
| 44466.94113425926 | 45.2 |
| 44466.983495370376 | 44.736 |
| 44467.02585648148 | 44.273 |
| 44467.06821759259 | 43.964 |
| 44467.11057870371 | 43.733 |
| 44467.15293981482 | 43.424 |
| 44467.19530092592 | 43.269 |
| 44467.23766203704 | 42.96 |
| 44467.28002314815 | 42.651 |
| 44467.322384259256 | 42.574 |
| 44467.364745370374 | 42.883 |
| 44467.407106481485 | 43.655 |
| 44467.44946759259 | 44.814 |
| 44467.49182870371 | 45.74 |
| 44467.53418981482 | 46.049 |
| 44467.57655092592 | 45.895 |
| 44467.61891203704 | 45.895 |
| 44467.66127314815 | 46.126 |
| 44467.70363425926 | 46.281 |
| 44467.74599537037 | 46.049 |
| 44467.788356481484 | 45.895 |
| 44467.830717592595 | 45.74 |
| 44467.873078703706 | 45.586 |
| 44467.91543981482 | 45.431 |
| 44467.95780092593 | 45.431 |
| 44468.00016203704 | 45.2 |
| 44468.04252314815 | 45.045 |
| 44468.08488425926 | 44.968 |
| 44468.12724537037 | 44.814 |
| 44468.16960648148 | 44.659 |
| 44468.21196759259 | 44.659 |
| 44468.254328703704 | 44.582 |
| 44468.296689814815 | 44.505 |
| 44468.33905092593 | 44.582 |
| 44468.38141203704 | 45.045 |
| 44468.42377314815 | 45.586 |
| 44468.466134259266 | 45.663 |
| 44468.50849537037 | 45.818 |
| 44468.55085648148 | 45.895 |
| 44468.5932175926 | 46.435 |
| 44468.6355787037 | 46.744 |
| 44468.677939814814 | 46.59 |
| 44468.72030092593 | 46.59 |
| 44468.762662037036 | 46.435 |
| 44468.80502314815 | 46.049 |
| 44468.847384259265 | 45.509 |
| 44468.88974537037 | 45.277 |
| 44468.93210648148 | 45.045 |
| 44468.9744675926 | 44.891 |
| 44469.01682870371 | 44.736 |
| 44469.05918981481 | 44.659 |
| 44469.10155092593 | 44.582 |
| 44469.14391203704 | 44.428 |
| 44469.186273148145 | 44.273 |
| 44469.22863425926 | 44.041 |
| 44469.270995370374 | 43.964 |
| 44469.31335648148 | 44.041 |
| 44469.355717592596 | 44.041 |
| 44469.39807870371 | 44.35 |
| 44469.44043981481 | 45.045 |
| 44469.48280092593 | 45.663 |
| 44469.52516203704 | 46.358 |
| 44469.567523148144 | 46.899 |
| 44469.60988425926 | 47.207 |
| 44469.65224537037 | 47.439 |
| 44469.694606481484 | 47.207 |
| 44469.736967592595 | 47.053 |
| 44469.779328703706 | 46.821 |
| 44469.82168981482 | 46.667 |
| 44469.86405092593 | 46.358 |
| 44469.90641203704 | 45.74 |
| 44469.94877314815 | 45.354 |
| 44469.99113425926 | 44.968 |
| 44470.03349537037 | 44.582 |
| 44470.07585648148 | 44.041 |
| 44470.11821759259 | 43.578 |
| 44470.160578703704 | 43.192 |
| 44470.202939814815 | 42.729 |
| 44470.24530092593 | 42.497 |
| 44470.28766203704 | 42.42 |
| 44470.33002314815 | 42.42 |
| 44470.372384259266 | 42.574 |
| 44470.41474537037 | 43.115 |
| 44470.45710648148 | 43.81 |
| 44470.4994675926 | 44.428 |
| 44470.5418287037 | 44.968 |
| 44470.58418981482 | 45.354 |
| 44470.626550925925 | 45.2 |
| 44470.668912037036 | 45.2 |
| 44470.711273148154 | 45.123 |
| 44470.75363425926 | 45.045 |
| 44470.79599537037 | 44.891 |
| 44470.83835648149 | 44.814 |
| 44470.8807175926 | 44.428 |
| 44470.9230787037 | 44.119 |
| 44470.96543981482 | 43.887 |
| 44471.00780092593 | 43.655 |
| 44471.050162037034 | 43.192 |
| 44471.09252314815 | 42.729 |
| 44471.13488425926 | 42.265 |
| 44471.17724537037 | 41.956 |
| 44471.219606481485 | 41.57 |
| 44471.261967592596 | 41.493 |
| 44471.3043287037 | 41.261 |
| 44471.34668981482 | 41.184 |
| 44471.38905092593 | 41.107 |
| 44471.43141203703 | 41.879 |
| 44471.47377314815 | 42.806 |
| 44471.51613425926 | 43.81 |
| 44471.55849537037 | 44.659 |
| 44471.600856481484 | 45.277 |
| 44471.643217592595 | 45.354 |
| 44471.685578703706 | 45.277 |
| 44471.72793981482 | 45.277 |
| 44471.77030092593 | 45.045 |
| 44471.81266203704 | 44.582 |
| 44471.85502314815 | 44.119 |
| 44471.89738425926 | 43.578 |
| 44471.93974537037 | 43.038 |
| 44471.98210648148 | 42.42 |
| 44472.02446759259 | 42.034 |
| 44472.066828703704 | 41.57 |
| 44472.109189814815 | 41.107 |
| 44472.151550925926 | 40.721 |
| 44472.19391203704 | 40.258 |
| 44472.236273148155 | 39.949 |
| 44472.27863425926 | 39.563 |
| 44472.32099537037 | 39.254 |
| 44472.36335648149 | 39.408 |
| 44472.40571759259 | 39.949 |
| 44472.4480787037 | 40.875 |
| 44472.49043981482 | 42.111 |
| 44472.532800925925 | 42.96 |
| 44472.575162037036 | 43.655 |
| 44472.617523148154 | 44.119 |
| 44472.65988425926 | 44.428 |
| 44472.70224537037 | 44.273 |
| 44472.74460648149 | 44.273 |
| 44472.7869675926 | 44.041 |
| 44472.8293287037 | 43.733 |
| 44472.87168981482 | 43.501 |
| 44472.91405092593 | 43.038 |
| 44472.956412037034 | 42.343 |
| 44472.99877314815 | 41.956 |
| 44473.04113425926 | 41.339 |
| 44473.083495370374 | 40.875 |
| 44473.125856481485 | 40.335 |
| 44473.16821759259 | 39.949 |
| 44473.21057870371 | 39.563 |
| 44473.25293981482 | 39.177 |
| 44473.29530092592 | 39.022 |
| 44473.33766203704 | 38.79 |
| 44473.38002314815 | 39.099 |
| 44473.42238425926 | 39.949 |
| 44473.46474537037 | 41.107 |
| 44473.507106481484 | 42.343 |
| 44473.549467592595 | 43.192 |
| 44473.591828703706 | 43.81 |
| 44473.63418981482 | 44.35 |
| 44473.67655092593 | 44.582 |
| 44473.71891203704 | 44.505 |
| 44473.76127314815 | 44.428 |
| 44473.80363425926 | 44.196 |
| 44473.84599537037 | 43.964 |
| 44473.88835648148 | 43.655 |
| 44473.93071759259 | 43.115 |
| 44473.973078703704 | 42.497 |
| 44474.015439814815 | 42.034 |
| 44474.057800925926 | 41.57 |
| 44474.100162037044 | 41.107 |
| 44474.14252314815 | 40.644 |
| 44474.18488425926 | 40.258 |
| 44474.22724537038 | 39.949 |
| 44474.26960648148 | 39.717 |
| 44474.31196759259 | 39.331 |
| 44474.35432870371 | 39.408 |
| 44474.396689814814 | 40.103 |
| 44474.439050925925 | 42.265 |
| 44474.48141203704 | 43.578 |
| 44474.52377314815 | 44.041 |
| 44474.56613425926 | 44.814 |
| 44474.608495370376 | 45.354 |
| 44474.65085648148 | 45.663 |
| 44474.69321759259 | 45.431 |
| 44474.73557870371 | 45.2 |
| 44474.77793981482 | 44.736 |
| 44474.82030092592 | 44.119 |
| 44474.86266203704 | 43.501 |
| 44474.90502314815 | 43.501 |
| 44474.947384259256 | 43.501 |
| 44474.989745370374 | 43.192 |
| 44475.032106481485 | 42.651 |
| 44475.07446759259 | 42.111 |
| 44475.11682870371 | 41.956 |
| 44475.15918981482 | 41.339 |
| 44475.20155092592 | 41.184 |
| 44475.24391203704 | 40.798 |
| 44475.28627314815 | 40.335 |
| 44475.32863425926 | 40.567 |
| 44475.37099537037 | 41.416 |
| 44475.413356481484 | 42.343 |
| 44475.455717592595 | 43.887 |
| 44475.498078703706 | 45.2 |
| 44475.54043981482 | 45.74 |
| 44475.58280092593 | 45.972 |
| 44475.62516203704 | 46.049 |
| 44475.66752314815 | 46.744 |
| 44475.70988425926 | 46.435 |
| 44475.75224537037 | 45.818 |
| 44475.79460648148 | 44.968 |
| 44475.83696759259 | 44.196 |
| 44475.879328703704 | 43.578 |
| 44475.921689814815 | 42.883 |
| 44475.96405092593 | 42.111 |
| 44476.00641203704 | 41.648 |
| 44476.04877314815 | 41.03 |
| 44476.091134259266 | 40.335 |
| 44476.13349537037 | 39.717 |
| 44476.17585648148 | 39.254 |
| 44476.2182175926 | 38.636 |
| 44476.2605787037 | 38.25 |
| 44476.302939814814 | 37.941 |
| 44476.34530092593 | 37.941 |
| 44476.387662037036 | 39.022 |
| 44476.43002314815 | 41.493 |
| 44476.472384259265 | 42.651 |
| 44476.51474537037 | 43.81 |
| 44476.55710648148 | 43.733 |
| 44476.5994675926 | 44.273 |
| 44476.64182870371 | 44.428 |
| 44476.68418981481 | 44.814 |
| 44476.72655092593 | 44.968 |
| 44476.76891203704 | 44.505 |
| 44476.811273148145 | 44.196 |
| 44476.85363425926 | 43.887 |
| 44476.895995370374 | 43.733 |
| 44476.93835648148 | 43.192 |
| 44476.980717592596 | 42.729 |
| 44477.02307870371 | 41.956 |
| 44477.06543981481 | 40.953 |
| 44477.10780092593 | 40.258 |
| 44477.15016203704 | 39.949 |
| 44477.192523148144 | 39.408 |
| 44477.23488425926 | 38.945 |
| 44477.27724537037 | 38.327 |
| 44477.319606481484 | 38.173 |
| 44477.361967592595 | 38.945 |
| 44477.404328703706 | 40.026 |
| 44477.44668981482 | 42.96 |
| 44477.48905092593 | 43.887 |
| 44477.53141203704 | 44.196 |
| 44477.57377314815 | 45.509 |
| 44477.61613425926 | 44.891 |
| 44477.65849537037 | 44.968 |
| 44477.70085648148 | 44.273 |
| 44477.74321759259 | 43.964 |
| 44477.785578703704 | 43.578 |
| 44477.827939814815 | 42.651 |
| 44477.87030092593 | 42.883 |
| 44477.91266203704 | 43.038 |
| 44477.95502314815 | 43.115 |
| 44477.997384259266 | 43.038 |
| 44478.03974537037 | 42.96 |
| 44478.08210648148 | 42.883 |
| 44478.1244675926 | 42.729 |
| 44478.1668287037 | 42.651 |
| 44478.20918981482 | 42.806 |
| 44478.251550925925 | 42.729 |
| 44478.293912037036 | 42.497 |
| 44478.336273148154 | 42.265 |
| 44478.37863425926 | 42.42 |
| 44478.42099537037 | 42.574 |
| 44478.46335648149 | 42.651 |
| 44478.5057175926 | 42.497 |
| 44478.5480787037 | 42.343 |
| 44478.59043981482 | 42.883 |
| 44478.63280092593 | 42.806 |
| 44478.675162037034 | 42.497 |
| 44478.71752314815 | 42.265 |
| 44478.75988425926 | 42.034 |
| 44478.80224537037 | 41.57 |
| 44478.844606481485 | 41.184 |
| 44478.886967592596 | 40.875 |
| 44478.9293287037 | 40.644 |
| 44478.97168981482 | 40.103 |
| 44479.01405092593 | 39.717 |
| 44479.05641203703 | 39.254 |
| 44479.09877314815 | 39.022 |
| 44479.14113425926 | 38.636 |
| 44479.18349537037 | 38.482 |
| 44479.225856481484 | 38.327 |
| 44479.268217592595 | 38.173 |
| 44479.310578703706 | 38.095 |
| 44479.35293981482 | 38.095 |
| 44479.39530092593 | 38.327 |
| 44479.43766203704 | 38.713 |
| 44479.48002314815 | 39.64 |
| 44479.52238425926 | 40.103 |
| 44479.56474537037 | 40.798 |
| 44479.60710648148 | 41.107 |
| 44479.64946759259 | 41.339 |
| 44479.691828703704 | 41.416 |
| 44479.734189814815 | 41.184 |
| 44479.776550925926 | 41.03 |
| 44479.81891203704 | 40.798 |
| 44479.861273148155 | 40.489 |
| 44479.90363425926 | 40.026 |
| 44479.94599537037 | 39.563 |
| 44479.98835648149 | 39.022 |
| 44480.03071759259 | 38.636 |
| 44480.0730787037 | 38.095 |
| 44480.11543981482 | 37.632 |
| 44480.157800925925 | 37.246 |
| 44480.200162037036 | 36.86 |
| 44480.242523148154 | 36.474 |
| 44480.28488425926 | 36.088 |
| 44480.32724537037 | 35.933 |
| 44480.36960648149 | 36.01 |
| 44480.4119675926 | 36.551 |
| 44480.4543287037 | 37.864 |
| 44480.49668981482 | 38.636 |
| 44480.53905092593 | 39.64 |
| 44480.581412037034 | 40.489 |
| 44480.62377314815 | 40.953 |
| 44480.66613425926 | 41.107 |
| 44480.708495370374 | 41.107 |
| 44480.750856481485 | 41.184 |
| 44480.79321759259 | 41.107 |
| 44480.83557870371 | 40.721 |
| 44480.87793981482 | 40.258 |
| 44480.92030092592 | 40.026 |
| 44480.96266203704 | 39.64 |
| 44481.00502314815 | 39.254 |
| 44481.04738425926 | 38.868 |
| 44481.08974537037 | 38.636 |
| 44481.132106481484 | 38.559 |
| 44481.174467592595 | 38.327 |
| 44481.216828703706 | 38.25 |
| 44481.25918981482 | 38.018 |
| 44481.30155092593 | 38.018 |
| 44481.34391203704 | 37.864 |
| 44481.38627314815 | 38.095 |
| 44481.42863425926 | 38.868 |
| 44481.47099537037 | 39.254 |
| 44481.51335648148 | 39.563 |
| 44481.55571759259 | 39.949 |
| 44481.598078703704 | 39.254 |
| 44481.640439814815 | 39.331 |
| 44481.682800925926 | 39.331 |
| 44481.725162037044 | 39.177 |
| 44481.76752314815 | 38.404 |
| 44481.80988425926 | 38.018 |
| 44481.85224537038 | 37.632 |
| 44481.89460648148 | 37.014 |
| 44481.93696759259 | 36.86 |
| 44481.97932870371 | 36.628 |
| 44482.021689814814 | 36.397 |
| 44482.064050925925 | 36.165 |
| 44482.10641203704 | 35.856 |
| 44482.14877314815 | 35.624 |
| 44482.19113425926 | 35.238 |
| 44482.233495370376 | 35.007 |
| 44482.27585648148 | 34.775 |
| 44482.31821759259 | 34.621 |
| 44482.36057870371 | 34.543 |
| 44482.40293981482 | 35.315 |
| 44482.44530092592 | 36.319 |
| 44482.48766203704 | 37.864 |
| 44482.53002314815 | 37.709 |
| 44482.572384259256 | 38.636 |
| 44482.614745370374 | 38.327 |
| 44482.657106481485 | 37.941 |
| 44482.69946759259 | 37.632 |
| 44482.74182870371 | 37.246 |
| 44482.78418981482 | 36.937 |
| 44482.82655092592 | 36.474 |
| 44482.86891203704 | 36.165 |
| 44482.91127314815 | 35.702 |
| 44482.95363425926 | 35.315 |
| 44482.99599537037 | 34.852 |
| 44483.038356481484 | 34.466 |
| 44483.080717592595 | 34.08 |
| 44483.123078703706 | 34.003 |
| 44483.16543981482 | 33.848 |
| 44483.20780092593 | 33.771 |
| 44483.25016203704 | 33.617 |
| 44483.29252314815 | 33.462 |
| 44483.33488425926 | 33.462 |
| 44483.37724537037 | 33.385 |
| 44483.41960648148 | 33.926 |
| 44483.46196759259 | 34.698 |
| 44483.504328703704 | 34.543 |
| 44483.546689814815 | 34.08 |
| 44483.58905092593 | 34.698 |
| 44483.63141203704 | 35.007 |
| 44483.67377314815 | 34.466 |
| 44483.716134259266 | 34.389 |
| 44483.75849537037 | 34.234 |
| 44483.80085648148 | 34.003 |
| 44483.8432175926 | 33.848 |
| 44483.8855787037 | 33.539 |
| 44483.927939814814 | 32.381 |
| 44483.97030092593 | 32.613 |
| 44484.012662037036 | 32.536 |
| 44484.05502314815 | 32.536 |
| 44484.097384259265 | 32.458 |
| 44484.13974537037 | 32.381 |
| 44484.18210648148 | 31.918 |
| 44484.2244675926 | 31.3 |
| 44484.26682870371 | 30.373 |
| 44484.30918981481 | 30.142 |
| 44484.35155092593 | 30.682 |
| 44484.39391203704 | 31.454 |
| 44484.436273148145 | 32.613 |
| 44484.47863425926 | 32.844 |
| 44484.520995370374 | 32.69 |
| 44484.56335648148 | 33.617 |
| 44484.605717592596 | 34.234 |
| 44484.64807870371 | 33.926 |
| 44484.69043981481 | 33.694 |
| 44484.73280092593 | 33.385 |
| 44484.77516203704 | 33.308 |
| 44484.817523148144 | 33.076 |
| 44484.85988425926 | 32.767 |
| 44484.90224537037 | 32.458 |
| 44484.944606481484 | 32.227 |
| 44484.986967592595 | 32.072 |
| 44485.029328703706 | 32.149 |
| 44485.07168981482 | 32.149 |
| 44485.11405092593 | 32.227 |
| 44485.15641203704 | 32.227 |
| 44485.19877314815 | 32.149 |
| 44485.24113425926 | 32.227 |
| 44485.28349537037 | 32.227 |
| 44485.32585648148 | 32.227 |
| 44485.36821759259 | 32.149 |
| 44485.410578703704 | 32.149 |
| 44485.452939814815 | 32.381 |
| 44485.49530092593 | 32.304 |
| 44485.53766203704 | 32.381 |
| 44485.58002314815 | 34.08 |
| 44485.622384259266 | 34.08 |
| 44485.66474537037 | 34.003 |
| 44485.70710648148 | 34.003 |
| 44485.7494675926 | 34.08 |
| 44485.7918287037 | 34.157 |
| 44485.83418981482 | 34.08 |
| 44485.876550925925 | 33.848 |
| 44485.918912037036 | 33.539 |
| 44485.961273148154 | 33.308 |
| 44486.00363425926 | 33.076 |
| 44486.04599537037 | 32.844 |
| 44486.08835648149 | 32.613 |
| 44486.1307175926 | 32.458 |
| 44486.1730787037 | 32.381 |
| 44486.21543981482 | 32.072 |
| 44486.25780092593 | 32.072 |
| 44486.300162037034 | 32.149 |
| 44486.34252314815 | 32.149 |
| 44486.38488425926 | 32.149 |
| 44486.42724537037 | 32.458 |
| 44486.469606481485 | 35.084 |
| 44486.511967592596 | 34.157 |
| 44486.5543287037 | 36.088 |
| 44486.59668981482 | 36.551 |
| 44486.63905092593 | 36.551 |
| 44486.68141203703 | 36.628 |
| 44486.72377314815 | 36.628 |
| 44486.76613425926 | 36.551 |
| 44486.80849537037 | 36.165 |
| 44486.850856481484 | 35.779 |
| 44486.893217592595 | 35.315 |
| 44486.935578703706 | 34.929 |
| 44486.97793981482 | 34.621 |
| 44487.02030092593 | 34.312 |
| 44487.06266203704 | 34.003 |
| 44487.10502314815 | 33.771 |
| 44487.14738425926 | 33.539 |
| 44487.18974537037 | 33.231 |
| 44487.23210648148 | 33.231 |
| 44487.27446759259 | 33.076 |
| 44487.316828703704 | 32.922 |
| 44487.359189814815 | 32.844 |
| 44487.401550925926 | 33.462 |
| 44487.44391203704 | 34.543 |
| 44487.486273148155 | 35.702 |
| 44487.52863425926 | 37.014 |
| 44487.57099537037 | 37.787 |
| 44487.61335648149 | 38.404 |
| 44487.65571759259 | 38.559 |
| 44487.6980787037 | 38.482 |
| 44487.74043981482 | 38.559 |
| 44487.782800925925 | 38.404 |
| 44487.825162037036 | 38.173 |
| 44487.867523148154 | 37.787 |
| 44487.90988425926 | 37.246 |
| 44487.95224537037 | 36.705 |
| 44487.99460648149 | 36.242 |
| 44488.0369675926 | 35.624 |
| 44488.0793287037 | 35.161 |
| 44488.12168981482 | 34.621 |
| 44488.16405092593 | 34.312 |
| 44488.206412037034 | 34.157 |
| 44488.24877314815 | 34.466 |
| 44488.29113425926 | 33.771 |
| 44488.333495370374 | 34.08 |
| 44488.375856481485 | 34.234 |
| 44488.41821759259 | 34.543 |
| 44488.46057870371 | 35.856 |
| 44488.50293981482 | 36.551 |
| 44488.54530092592 | 37.092 |
| 44488.58766203704 | 37.709 |
| 44488.63002314815 | 37.787 |
| 44488.67238425926 | 37.478 |
| 44488.71474537037 | 37.323 |
| 44488.757106481484 | 37.092 |
| 44488.799467592595 | 36.551 |
| 44488.841828703706 | 36.319 |
| 44488.88418981482 | 36.01 |
| 44488.92655092593 | 35.702 |
| 44488.96891203704 | 35.161 |
| 44489.01127314815 | 34.698 |
| 44489.05363425926 | 34.157 |
| 44489.09599537037 | 33.771 |
| 44489.13835648148 | 33.308 |
| 44489.18071759259 | 33.076 |
| 44489.223078703704 | 32.69 |
| 44489.265439814815 | 32.227 |
| 44489.307800925926 | 29.91 |
| 44489.350162037044 | 28.211 |
| 44489.39252314815 | 29.833 |
| 44489.43488425926 | 31.763 |
| 44489.47724537038 | 32.767 |
| 44489.51960648148 | 32.922 |
| 44489.56196759259 | 33.231 |
| 44489.60432870371 | 33.771 |
| 44489.646689814814 | 36.01 |
| 44489.689050925925 | 35.856 |
| 44489.73141203704 | 35.779 |
| 44489.77377314815 | 35.393 |
| 44489.81613425926 | 34.929 |
| 44489.858495370376 | 34.543 |
| 44489.90085648148 | 34.08 |
| 44489.94321759259 | 33.694 |
| 44489.98557870371 | 33.308 |
| 44490.02793981482 | 32.922 |
| 44490.07030092592 | 32.536 |
| 44490.11266203704 | 32.304 |
| 44490.15502314815 | 32.072 |
| 44490.197384259256 | 31.068 |
| 44490.239745370374 | 30.837 |
| 44490.282106481485 | 29.37 |
| 44490.32446759259 | 29.292 |
| 44490.36682870371 | 31.377 |
| 44490.40918981482 | 32.072 |
| 44490.45155092592 | 33.231 |
| 44490.49391203704 | 33.848 |
| 44490.53627314815 | 33.231 |
| 44490.57863425926 | 33.694 |
| 44490.62099537037 | 35.779 |
| 44490.663356481484 | 35.702 |
| 44490.705717592595 | 35.779 |
| 44490.748078703706 | 35.779 |
| 44490.79043981482 | 35.47 |
| 44490.83280092593 | 35.238 |
| 44490.87516203704 | 34.852 |
| 44490.91752314815 | 34.466 |
| 44490.95988425926 | 34.003 |
| 44491.00224537037 | 33.539 |
| 44491.04460648148 | 33.153 |
| 44491.08696759259 | 32.922 |
| 44491.129328703704 | 32.536 |
| 44491.171689814815 | 32.304 |
| 44491.21405092593 | 31.763 |
| 44491.25641203704 | 31.3 |
| 44491.29877314815 | 30.991 |
| 44491.341134259266 | 30.759 |
| 44491.38349537037 | 31.068 |
| 44491.42585648148 | 32.072 |
| 44491.4682175926 | 33.771 |
| 44491.5105787037 | 35.702 |
| 44491.552939814814 | 35.238 |
| 44491.59530092593 | 35.779 |
| 44491.637662037036 | 36.628 |
| 44491.68002314815 | 36.937 |
| 44491.722384259265 | 37.092 |
| 44491.76474537037 | 36.937 |
| 44491.80710648148 | 36.705 |
| 44491.8494675926 | 36.628 |
| 44491.89182870371 | 36.165 |
| 44491.93418981481 | 35.393 |
| 44491.97655092593 | 34.698 |
| 44492.01891203704 | 34.312 |
| 44492.061273148145 | 33.771 |
| 44492.10363425926 | 33.231 |
| 44492.145995370374 | 32.844 |
| 44492.18835648148 | 32.536 |
| 44492.230717592596 | 32.613 |
| 44492.27307870371 | 32.381 |
| 44492.31543981481 | 32.072 |
| 44492.35780092593 | 32.072 |
| 44492.40016203704 | 32.613 |
| 44492.442523148144 | 33.385 |
| 44492.48488425926 | 35.393 |
| 44492.52724537037 | 37.709 |
| 44492.569606481484 | 40.026 |
| 44492.611967592595 | 39.177 |
| 44492.654328703706 | 38.636 |
| 44492.69668981482 | 38.482 |
| 44492.73905092593 | 38.095 |
| 44492.78141203704 | 37.709 |
| 44492.82377314815 | 37.323 |
| 44492.86613425926 | 36.551 |
| 44492.90849537037 | 36.705 |
| 44492.95085648148 | 36.474 |
| 44492.99321759259 | 35.779 |
| 44493.035578703704 | 35.702 |
| 44493.077939814815 | 35.856 |
| 44493.12030092593 | 35.624 |
| 44493.16266203704 | 35.702 |
| 44493.20502314815 | 35.47 |
| 44493.247384259266 | 34.157 |
| 44493.28974537037 | 34.157 |
| 44493.33210648148 | 34.003 |
| 44493.3744675926 | 34.312 |
| 44493.4168287037 | 34.775 |
| 44493.45918981482 | 36.628 |
| 44493.501550925925 | 38.018 |
| 44493.543912037036 | 37.787 |
| 44493.586273148154 | 37.555 |
| 44493.62863425926 | 37.864 |
| 44493.67099537037 | 38.173 |
| 44493.71335648149 | 38.173 |
| 44493.7557175926 | 37.709 |
| 44493.7980787037 | 37.092 |
| 44493.84043981482 | 36.551 |
| 44493.88280092593 | 36.242 |
| 44493.925162037034 | 35.856 |
| 44493.96752314815 | 35.547 |
| 44494.00988425926 | 35.084 |
| 44494.05224537037 | 34.852 |
| 44494.094606481485 | 34.775 |
| 44494.136967592596 | 34.698 |
| 44494.1793287037 | 34.466 |
| 44494.22168981482 | 34.234 |
| 44494.26405092593 | 34.234 |
| 44494.30641203703 | 34.003 |
| 44494.34877314815 | 34.08 |
| 44494.39113425926 | 34.543 |
| 44494.43349537037 | 35.624 |
| 44494.475856481484 | 38.018 |
| 44494.518217592595 | 38.25 |
| 44494.560578703706 | 39.177 |
| 44494.60293981482 | 39.872 |
| 44494.64530092593 | 39.949 |
| 44494.68766203704 | 39.717 |
| 44494.73002314815 | 39.408 |
| 44494.77238425926 | 39.022 |
| 44494.81474537037 | 38.636 |
| 44494.85710648148 | 38.25 |
| 44494.89946759259 | 37.941 |
| 44494.941828703704 | 37.632 |
| 44494.984189814815 | 37.246 |
| 44495.026550925926 | 36.86 |
| 44495.06891203704 | 36.474 |
| 44495.111273148155 | 36.01 |
| 44495.15363425926 | 35.702 |
| 44495.19599537037 | 35.393 |
| 44495.23835648149 | 35.238 |
| 44495.28071759259 | 35.238 |
| 44495.3230787037 | 35.393 |
| 44495.36543981482 | 35.624 |
| 44495.407800925925 | 36.319 |
| 44495.450162037036 | 36.86 |
| 44495.492523148154 | 36.705 |
| 44495.53488425926 | 36.474 |
| 44495.57724537037 | 37.092 |
| 44495.61960648149 | 37.4 |
| 44495.6619675926 | 37.323 |
| 44495.7043287037 | 36.551 |
| 44495.74668981482 | 36.01 |
| 44495.78905092593 | 35.47 |
| 44495.831412037034 | 34.543 |
| 44495.87377314815 | 33.771 |
| 44495.91613425926 | 33.617 |
| 44495.958495370374 | 33.617 |
| 44496.000856481485 | 33.462 |
| 44496.04321759259 | 33.462 |
| 44496.08557870371 | 33.462 |
| 44496.12793981482 | 33.231 |
| 44496.17030092592 | 33.076 |
| 44496.21266203704 | 32.922 |
| 44496.25502314815 | 32.844 |
| 44496.29738425926 | 32.69 |
| 44496.33974537037 | 32.613 |
| 44496.382106481484 | 32.536 |
| 44496.424467592595 | 32.767 |